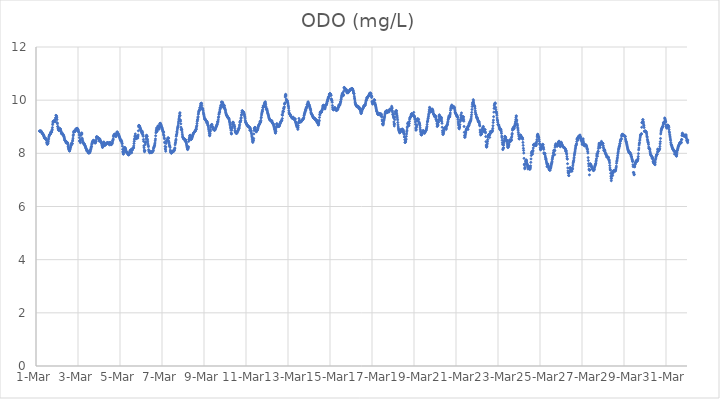
| Category | ODO (mg/L) |
|---|---|
| 44986.166666666664 | 8.84 |
| 44986.177083333336 | 8.83 |
| 44986.1875 | 8.84 |
| 44986.197916666664 | 8.83 |
| 44986.208333333336 | 8.82 |
| 44986.21875 | 8.84 |
| 44986.229166666664 | 8.84 |
| 44986.239583333336 | 8.84 |
| 44986.25 | 8.82 |
| 44986.260416666664 | 8.8 |
| 44986.270833333336 | 8.79 |
| 44986.28125 | 8.77 |
| 44986.291666666664 | 8.76 |
| 44986.302083333336 | 8.74 |
| 44986.3125 | 8.75 |
| 44986.322916666664 | 8.73 |
| 44986.333333333336 | 8.72 |
| 44986.34375 | 8.71 |
| 44986.354166666664 | 8.69 |
| 44986.364583333336 | 8.66 |
| 44986.375 | 8.66 |
| 44986.385416666664 | 8.63 |
| 44986.395833333336 | 8.6 |
| 44986.40625 | 8.57 |
| 44986.416666666664 | 8.58 |
| 44986.427083333336 | 8.57 |
| 44986.4375 | 8.57 |
| 44986.447916666664 | 8.56 |
| 44986.458333333336 | 8.54 |
| 44986.46875 | 8.54 |
| 44986.479166666664 | 8.55 |
| 44986.489583333336 | 8.5 |
| 44986.5 | 8.48 |
| 44986.510416666664 | 8.4 |
| 44986.520833333336 | 8.39 |
| 44986.53125 | 8.35 |
| 44986.541666666664 | 8.34 |
| 44986.552083333336 | 8.35 |
| 44986.5625 | 8.37 |
| 44986.572916666664 | 8.39 |
| 44986.583333333336 | 8.44 |
| 44986.59375 | 8.51 |
| 44986.604166666664 | 8.57 |
| 44986.614583333336 | 8.62 |
| 44986.625 | 8.65 |
| 44986.635416666664 | 8.68 |
| 44986.645833333336 | 8.7 |
| 44986.65625 | 8.7 |
| 44986.666666666664 | 8.72 |
| 44986.677083333336 | 8.72 |
| 44986.6875 | 8.73 |
| 44986.697916666664 | 8.78 |
| 44986.708333333336 | 8.79 |
| 44986.71875 | 8.81 |
| 44986.729166666664 | 8.79 |
| 44986.739583333336 | 8.8 |
| 44986.75 | 8.8 |
| 44986.760416666664 | 8.86 |
| 44986.770833333336 | 8.9 |
| 44986.78125 | 8.97 |
| 44986.791666666664 | 9.08 |
| 44986.802083333336 | 9.14 |
| 44986.8125 | 9.19 |
| 44986.822916666664 | 9.2 |
| 44986.833333333336 | 9.2 |
| 44986.84375 | 9.21 |
| 44986.854166666664 | 9.22 |
| 44986.864583333336 | 9.23 |
| 44986.875 | 9.22 |
| 44986.885416666664 | 9.23 |
| 44986.895833333336 | 9.22 |
| 44986.90625 | 9.2 |
| 44986.916666666664 | 9.19 |
| 44986.927083333336 | 9.33 |
| 44986.9375 | 9.28 |
| 44986.947916666664 | 9.43 |
| 44986.958333333336 | 9.35 |
| 44986.96875 | 9.42 |
| 44986.979166666664 | 9.39 |
| 44986.989583333336 | 9.34 |
| 44987.0 | 9.27 |
| 44987.010416666664 | 9.15 |
| 44987.020833333336 | 9.11 |
| 44987.03125 | 9.01 |
| 44987.041666666664 | 9 |
| 44987.052083333336 | 8.94 |
| 44987.0625 | 8.91 |
| 44987.072916666664 | 8.88 |
| 44987.083333333336 | 8.88 |
| 44987.09375 | 8.86 |
| 44987.104166666664 | 8.87 |
| 44987.114583333336 | 8.89 |
| 44987.125 | 8.92 |
| 44987.135416666664 | 8.93 |
| 44987.145833333336 | 8.92 |
| 44987.15625 | 8.92 |
| 44987.166666666664 | 8.9 |
| 44987.177083333336 | 8.85 |
| 44987.1875 | 8.83 |
| 44987.197916666664 | 8.8 |
| 44987.208333333336 | 8.76 |
| 44987.21875 | 8.73 |
| 44987.229166666664 | 8.75 |
| 44987.239583333336 | 8.75 |
| 44987.25 | 8.76 |
| 44987.260416666664 | 8.73 |
| 44987.270833333336 | 8.72 |
| 44987.28125 | 8.72 |
| 44987.291666666664 | 8.7 |
| 44987.302083333336 | 8.68 |
| 44987.3125 | 8.67 |
| 44987.322916666664 | 8.65 |
| 44987.333333333336 | 8.63 |
| 44987.34375 | 8.59 |
| 44987.354166666664 | 8.55 |
| 44987.364583333336 | 8.51 |
| 44987.375 | 8.49 |
| 44987.385416666664 | 8.48 |
| 44987.395833333336 | 8.47 |
| 44987.40625 | 8.46 |
| 44987.416666666664 | 8.45 |
| 44987.427083333336 | 8.41 |
| 44987.4375 | 8.39 |
| 44987.447916666664 | 8.43 |
| 44987.458333333336 | 8.42 |
| 44987.46875 | 8.42 |
| 44987.479166666664 | 8.39 |
| 44987.489583333336 | 8.41 |
| 44987.5 | 8.39 |
| 44987.510416666664 | 8.37 |
| 44987.520833333336 | 8.33 |
| 44987.53125 | 8.26 |
| 44987.541666666664 | 8.23 |
| 44987.552083333336 | 8.18 |
| 44987.5625 | 8.16 |
| 44987.572916666664 | 8.15 |
| 44987.583333333336 | 8.11 |
| 44987.59375 | 8.09 |
| 44987.604166666664 | 8.09 |
| 44987.614583333336 | 8.13 |
| 44987.625 | 8.16 |
| 44987.635416666664 | 8.2 |
| 44987.645833333336 | 8.23 |
| 44987.65625 | 8.3 |
| 44987.666666666664 | 8.28 |
| 44987.677083333336 | 8.34 |
| 44987.6875 | 8.38 |
| 44987.697916666664 | 8.33 |
| 44987.708333333336 | 8.36 |
| 44987.71875 | 8.36 |
| 44987.729166666664 | 8.37 |
| 44987.739583333336 | 8.46 |
| 44987.75 | 8.5 |
| 44987.760416666664 | 8.57 |
| 44987.770833333336 | 8.66 |
| 44987.78125 | 8.71 |
| 44987.791666666664 | 8.79 |
| 44987.802083333336 | 8.82 |
| 44987.8125 | 8.84 |
| 44987.822916666664 | 8.82 |
| 44987.833333333336 | 8.82 |
| 44987.84375 | 8.82 |
| 44987.854166666664 | 8.82 |
| 44987.864583333336 | 8.84 |
| 44987.875 | 8.85 |
| 44987.885416666664 | 8.88 |
| 44987.895833333336 | 8.91 |
| 44987.90625 | 8.92 |
| 44987.916666666664 | 8.9 |
| 44987.927083333336 | 8.9 |
| 44987.9375 | 8.9 |
| 44987.947916666664 | 8.94 |
| 44987.958333333336 | 8.93 |
| 44987.96875 | 8.94 |
| 44987.979166666664 | 8.91 |
| 44987.989583333336 | 8.9 |
| 44988.0 | 8.9 |
| 44988.010416666664 | 8.83 |
| 44988.020833333336 | 8.84 |
| 44988.03125 | 8.81 |
| 44988.041666666664 | 8.78 |
| 44988.052083333336 | 8.69 |
| 44988.0625 | 8.59 |
| 44988.072916666664 | 8.46 |
| 44988.083333333336 | 8.47 |
| 44988.09375 | 8.47 |
| 44988.104166666664 | 8.48 |
| 44988.114583333336 | 8.4 |
| 44988.125 | 8.52 |
| 44988.135416666664 | 8.67 |
| 44988.145833333336 | 8.72 |
| 44988.15625 | 8.74 |
| 44988.166666666664 | 8.72 |
| 44988.177083333336 | 8.77 |
| 44988.1875 | 8.73 |
| 44988.197916666664 | 8.57 |
| 44988.208333333336 | 8.53 |
| 44988.21875 | 8.47 |
| 44988.229166666664 | 8.44 |
| 44988.239583333336 | 8.41 |
| 44988.25 | 8.39 |
| 44988.260416666664 | 8.38 |
| 44988.270833333336 | 8.38 |
| 44988.28125 | 8.36 |
| 44988.291666666664 | 8.34 |
| 44988.302083333336 | 8.34 |
| 44988.3125 | 8.34 |
| 44988.322916666664 | 8.31 |
| 44988.333333333336 | 8.29 |
| 44988.34375 | 8.27 |
| 44988.354166666664 | 8.25 |
| 44988.364583333336 | 8.21 |
| 44988.375 | 8.2 |
| 44988.385416666664 | 8.18 |
| 44988.395833333336 | 8.16 |
| 44988.40625 | 8.14 |
| 44988.416666666664 | 8.11 |
| 44988.427083333336 | 8.09 |
| 44988.4375 | 8.08 |
| 44988.447916666664 | 8.09 |
| 44988.458333333336 | 8.1 |
| 44988.46875 | 8.09 |
| 44988.479166666664 | 8.06 |
| 44988.489583333336 | 8.02 |
| 44988.5 | 8.01 |
| 44988.510416666664 | 8.03 |
| 44988.520833333336 | 8.04 |
| 44988.53125 | 8.02 |
| 44988.541666666664 | 8.03 |
| 44988.552083333336 | 8.02 |
| 44988.5625 | 8.05 |
| 44988.572916666664 | 8.05 |
| 44988.583333333336 | 8.08 |
| 44988.59375 | 8.13 |
| 44988.604166666664 | 8.14 |
| 44988.614583333336 | 8.18 |
| 44988.625 | 8.22 |
| 44988.635416666664 | 8.26 |
| 44988.645833333336 | 8.26 |
| 44988.65625 | 8.34 |
| 44988.666666666664 | 8.37 |
| 44988.677083333336 | 8.4 |
| 44988.6875 | 8.43 |
| 44988.697916666664 | 8.44 |
| 44988.708333333336 | 8.46 |
| 44988.71875 | 8.47 |
| 44988.729166666664 | 8.48 |
| 44988.739583333336 | 8.49 |
| 44988.75 | 8.48 |
| 44988.760416666664 | 8.46 |
| 44988.770833333336 | 8.43 |
| 44988.78125 | 8.41 |
| 44988.791666666664 | 8.4 |
| 44988.802083333336 | 8.4 |
| 44988.8125 | 8.4 |
| 44988.822916666664 | 8.39 |
| 44988.833333333336 | 8.4 |
| 44988.84375 | 8.44 |
| 44988.854166666664 | 8.45 |
| 44988.864583333336 | 8.5 |
| 44988.875 | 8.58 |
| 44988.885416666664 | 8.63 |
| 44988.895833333336 | 8.62 |
| 44988.90625 | 8.61 |
| 44988.916666666664 | 8.6 |
| 44988.927083333336 | 8.6 |
| 44988.9375 | 8.59 |
| 44988.947916666664 | 8.59 |
| 44988.958333333336 | 8.58 |
| 44988.96875 | 8.57 |
| 44988.979166666664 | 8.57 |
| 44988.989583333336 | 8.54 |
| 44989.0 | 8.52 |
| 44989.010416666664 | 8.46 |
| 44989.020833333336 | 8.51 |
| 44989.03125 | 8.55 |
| 44989.041666666664 | 8.52 |
| 44989.052083333336 | 8.48 |
| 44989.0625 | 8.46 |
| 44989.072916666664 | 8.48 |
| 44989.083333333336 | 8.44 |
| 44989.09375 | 8.42 |
| 44989.104166666664 | 8.42 |
| 44989.114583333336 | 8.41 |
| 44989.125 | 8.36 |
| 44989.135416666664 | 8.36 |
| 44989.145833333336 | 8.3 |
| 44989.15625 | 8.27 |
| 44989.166666666664 | 8.22 |
| 44989.177083333336 | 8.24 |
| 44989.1875 | 8.27 |
| 44989.197916666664 | 8.32 |
| 44989.208333333336 | 8.39 |
| 44989.21875 | 8.31 |
| 44989.229166666664 | 8.43 |
| 44989.239583333336 | 8.4 |
| 44989.25 | 8.31 |
| 44989.260416666664 | 8.3 |
| 44989.270833333336 | 8.29 |
| 44989.28125 | 8.34 |
| 44989.291666666664 | 8.33 |
| 44989.302083333336 | 8.32 |
| 44989.3125 | 8.33 |
| 44989.322916666664 | 8.35 |
| 44989.333333333336 | 8.34 |
| 44989.34375 | 8.35 |
| 44989.354166666664 | 8.37 |
| 44989.364583333336 | 8.38 |
| 44989.375 | 8.39 |
| 44989.385416666664 | 8.39 |
| 44989.395833333336 | 8.4 |
| 44989.40625 | 8.4 |
| 44989.416666666664 | 8.39 |
| 44989.427083333336 | 8.39 |
| 44989.4375 | 8.39 |
| 44989.447916666664 | 8.38 |
| 44989.458333333336 | 8.35 |
| 44989.46875 | 8.39 |
| 44989.479166666664 | 8.38 |
| 44989.489583333336 | 8.38 |
| 44989.5 | 8.32 |
| 44989.510416666664 | 8.4 |
| 44989.520833333336 | 8.39 |
| 44989.53125 | 8.41 |
| 44989.541666666664 | 8.39 |
| 44989.552083333336 | 8.37 |
| 44989.5625 | 8.38 |
| 44989.572916666664 | 8.32 |
| 44989.583333333336 | 8.35 |
| 44989.59375 | 8.34 |
| 44989.604166666664 | 8.34 |
| 44989.614583333336 | 8.36 |
| 44989.625 | 8.38 |
| 44989.635416666664 | 8.4 |
| 44989.645833333336 | 8.46 |
| 44989.65625 | 8.48 |
| 44989.666666666664 | 8.51 |
| 44989.677083333336 | 8.54 |
| 44989.6875 | 8.63 |
| 44989.697916666664 | 8.67 |
| 44989.708333333336 | 8.68 |
| 44989.71875 | 8.69 |
| 44989.729166666664 | 8.71 |
| 44989.739583333336 | 8.71 |
| 44989.75 | 8.72 |
| 44989.760416666664 | 8.72 |
| 44989.770833333336 | 8.64 |
| 44989.78125 | 8.68 |
| 44989.791666666664 | 8.68 |
| 44989.802083333336 | 8.67 |
| 44989.8125 | 8.63 |
| 44989.822916666664 | 8.66 |
| 44989.833333333336 | 8.7 |
| 44989.84375 | 8.76 |
| 44989.854166666664 | 8.79 |
| 44989.864583333336 | 8.81 |
| 44989.875 | 8.79 |
| 44989.885416666664 | 8.78 |
| 44989.895833333336 | 8.75 |
| 44989.90625 | 8.73 |
| 44989.916666666664 | 8.72 |
| 44989.927083333336 | 8.72 |
| 44989.9375 | 8.7 |
| 44989.947916666664 | 8.67 |
| 44989.958333333336 | 8.65 |
| 44989.96875 | 8.62 |
| 44989.979166666664 | 8.6 |
| 44989.989583333336 | 8.58 |
| 44990.0 | 8.55 |
| 44990.010416666664 | 8.52 |
| 44990.020833333336 | 8.5 |
| 44990.03125 | 8.47 |
| 44990.041666666664 | 8.51 |
| 44990.052083333336 | 8.49 |
| 44990.0625 | 8.46 |
| 44990.072916666664 | 8.45 |
| 44990.083333333336 | 8.43 |
| 44990.09375 | 8.39 |
| 44990.104166666664 | 8.36 |
| 44990.114583333336 | 8.27 |
| 44990.125 | 8.15 |
| 44990.135416666664 | 8.06 |
| 44990.145833333336 | 8.04 |
| 44990.15625 | 7.97 |
| 44990.166666666664 | 7.98 |
| 44990.177083333336 | 8.05 |
| 44990.1875 | 8.12 |
| 44990.197916666664 | 8.21 |
| 44990.208333333336 | 8.18 |
| 44990.21875 | 8.22 |
| 44990.229166666664 | 8.21 |
| 44990.239583333336 | 8.21 |
| 44990.25 | 8.19 |
| 44990.260416666664 | 8.12 |
| 44990.270833333336 | 8.16 |
| 44990.28125 | 8.12 |
| 44990.291666666664 | 8.08 |
| 44990.302083333336 | 8.05 |
| 44990.3125 | 8.04 |
| 44990.322916666664 | 8.03 |
| 44990.333333333336 | 8.01 |
| 44990.34375 | 8.01 |
| 44990.354166666664 | 8.01 |
| 44990.364583333336 | 8 |
| 44990.375 | 7.98 |
| 44990.385416666664 | 7.96 |
| 44990.395833333336 | 7.95 |
| 44990.40625 | 7.95 |
| 44990.416666666664 | 7.94 |
| 44990.427083333336 | 7.95 |
| 44990.4375 | 7.96 |
| 44990.447916666664 | 8 |
| 44990.458333333336 | 8.04 |
| 44990.46875 | 8.07 |
| 44990.479166666664 | 8.09 |
| 44990.489583333336 | 8.1 |
| 44990.5 | 8.11 |
| 44990.510416666664 | 8.13 |
| 44990.520833333336 | 8.13 |
| 44990.53125 | 8.13 |
| 44990.541666666664 | 8.05 |
| 44990.552083333336 | 8.02 |
| 44990.5625 | 8.14 |
| 44990.572916666664 | 8.12 |
| 44990.583333333336 | 8.12 |
| 44990.59375 | 8.15 |
| 44990.604166666664 | 8.18 |
| 44990.614583333336 | 8.19 |
| 44990.625 | 8.21 |
| 44990.635416666664 | 8.21 |
| 44990.645833333336 | 8.21 |
| 44990.65625 | 8.28 |
| 44990.666666666664 | 8.37 |
| 44990.677083333336 | 8.45 |
| 44990.6875 | 8.52 |
| 44990.697916666664 | 8.56 |
| 44990.708333333336 | 8.65 |
| 44990.71875 | 8.64 |
| 44990.729166666664 | 8.73 |
| 44990.739583333336 | 8.64 |
| 44990.75 | 8.55 |
| 44990.760416666664 | 8.58 |
| 44990.770833333336 | 8.55 |
| 44990.78125 | 8.57 |
| 44990.791666666664 | 8.58 |
| 44990.802083333336 | 8.62 |
| 44990.8125 | 8.65 |
| 44990.822916666664 | 8.64 |
| 44990.833333333336 | 8.62 |
| 44990.84375 | 8.57 |
| 44990.854166666664 | 8.62 |
| 44990.864583333336 | 8.69 |
| 44990.875 | 8.85 |
| 44990.885416666664 | 9 |
| 44990.895833333336 | 9.05 |
| 44990.90625 | 9.05 |
| 44990.916666666664 | 9.03 |
| 44990.927083333336 | 9.02 |
| 44990.9375 | 9 |
| 44990.947916666664 | 8.98 |
| 44990.958333333336 | 8.96 |
| 44990.96875 | 8.93 |
| 44990.979166666664 | 8.91 |
| 44990.989583333336 | 8.88 |
| 44991.0 | 8.85 |
| 44991.010416666664 | 8.83 |
| 44991.020833333336 | 8.82 |
| 44991.03125 | 8.8 |
| 44991.041666666664 | 8.75 |
| 44991.052083333336 | 8.78 |
| 44991.0625 | 8.83 |
| 44991.072916666664 | 8.78 |
| 44991.083333333336 | 8.71 |
| 44991.09375 | 8.68 |
| 44991.104166666664 | 8.64 |
| 44991.114583333336 | 8.52 |
| 44991.125 | 8.45 |
| 44991.135416666664 | 8.28 |
| 44991.145833333336 | 8.21 |
| 44991.15625 | 8.12 |
| 44991.166666666664 | 8.06 |
| 44991.177083333336 | 8.09 |
| 44991.1875 | 8.1 |
| 44991.197916666664 | 8.33 |
| 44991.208333333336 | 8.4 |
| 44991.21875 | 8.4 |
| 44991.229166666664 | 8.44 |
| 44991.239583333336 | 8.55 |
| 44991.25 | 8.62 |
| 44991.260416666664 | 8.68 |
| 44991.270833333336 | 8.67 |
| 44991.28125 | 8.63 |
| 44991.291666666664 | 8.64 |
| 44991.302083333336 | 8.54 |
| 44991.3125 | 8.5 |
| 44991.322916666664 | 8.43 |
| 44991.333333333336 | 8.35 |
| 44991.34375 | 8.3 |
| 44991.354166666664 | 8.25 |
| 44991.364583333336 | 8.14 |
| 44991.375 | 8.09 |
| 44991.385416666664 | 8.08 |
| 44991.395833333336 | 8.05 |
| 44991.40625 | 8.04 |
| 44991.416666666664 | 8.02 |
| 44991.427083333336 | 8.02 |
| 44991.4375 | 8.03 |
| 44991.447916666664 | 8.05 |
| 44991.458333333336 | 8.06 |
| 44991.46875 | 8.06 |
| 44991.479166666664 | 8.03 |
| 44991.489583333336 | 8.03 |
| 44991.5 | 8.03 |
| 44991.510416666664 | 8.04 |
| 44991.520833333336 | 8.05 |
| 44991.53125 | 8.05 |
| 44991.541666666664 | 8.06 |
| 44991.552083333336 | 8.07 |
| 44991.5625 | 8.09 |
| 44991.572916666664 | 8.09 |
| 44991.583333333336 | 8.1 |
| 44991.59375 | 8.17 |
| 44991.604166666664 | 8.21 |
| 44991.614583333336 | 8.23 |
| 44991.625 | 8.25 |
| 44991.635416666664 | 8.28 |
| 44991.645833333336 | 8.3 |
| 44991.65625 | 8.35 |
| 44991.666666666664 | 8.39 |
| 44991.677083333336 | 8.47 |
| 44991.6875 | 8.54 |
| 44991.697916666664 | 8.66 |
| 44991.708333333336 | 8.77 |
| 44991.71875 | 8.84 |
| 44991.729166666664 | 8.88 |
| 44991.739583333336 | 8.95 |
| 44991.75 | 8.82 |
| 44991.760416666664 | 8.82 |
| 44991.770833333336 | 8.86 |
| 44991.78125 | 8.91 |
| 44991.791666666664 | 8.96 |
| 44991.802083333336 | 9.01 |
| 44991.8125 | 9.03 |
| 44991.822916666664 | 9.03 |
| 44991.833333333336 | 9.01 |
| 44991.84375 | 8.98 |
| 44991.854166666664 | 8.91 |
| 44991.864583333336 | 8.92 |
| 44991.875 | 8.97 |
| 44991.885416666664 | 9.01 |
| 44991.895833333336 | 9.1 |
| 44991.90625 | 9.13 |
| 44991.916666666664 | 9.13 |
| 44991.927083333336 | 9.12 |
| 44991.9375 | 9.1 |
| 44991.947916666664 | 9.08 |
| 44991.958333333336 | 9.05 |
| 44991.96875 | 9.02 |
| 44991.979166666664 | 9 |
| 44991.989583333336 | 8.98 |
| 44992.0 | 8.96 |
| 44992.010416666664 | 8.93 |
| 44992.020833333336 | 8.89 |
| 44992.03125 | 8.86 |
| 44992.041666666664 | 8.83 |
| 44992.052083333336 | 8.81 |
| 44992.0625 | 8.77 |
| 44992.072916666664 | 8.7 |
| 44992.083333333336 | 8.8 |
| 44992.09375 | 8.66 |
| 44992.104166666664 | 8.58 |
| 44992.114583333336 | 8.55 |
| 44992.125 | 8.42 |
| 44992.135416666664 | 8.39 |
| 44992.145833333336 | 8.26 |
| 44992.15625 | 8.17 |
| 44992.166666666664 | 8.14 |
| 44992.177083333336 | 8.08 |
| 44992.1875 | 8.24 |
| 44992.197916666664 | 8.37 |
| 44992.208333333336 | 8.43 |
| 44992.21875 | 8.49 |
| 44992.229166666664 | 8.48 |
| 44992.239583333336 | 8.47 |
| 44992.25 | 8.49 |
| 44992.260416666664 | 8.47 |
| 44992.270833333336 | 8.55 |
| 44992.28125 | 8.58 |
| 44992.291666666664 | 8.58 |
| 44992.302083333336 | 8.58 |
| 44992.3125 | 8.56 |
| 44992.322916666664 | 8.46 |
| 44992.333333333336 | 8.41 |
| 44992.34375 | 8.35 |
| 44992.354166666664 | 8.3 |
| 44992.364583333336 | 8.27 |
| 44992.375 | 8.27 |
| 44992.385416666664 | 8.22 |
| 44992.395833333336 | 8.12 |
| 44992.40625 | 8.06 |
| 44992.416666666664 | 8.05 |
| 44992.427083333336 | 8.03 |
| 44992.4375 | 8.01 |
| 44992.447916666664 | 8.01 |
| 44992.458333333336 | 8.02 |
| 44992.46875 | 8.04 |
| 44992.479166666664 | 8.05 |
| 44992.489583333336 | 8.07 |
| 44992.5 | 8.08 |
| 44992.510416666664 | 8.08 |
| 44992.520833333336 | 8.07 |
| 44992.53125 | 8.07 |
| 44992.541666666664 | 8.08 |
| 44992.552083333336 | 8.07 |
| 44992.5625 | 8.09 |
| 44992.572916666664 | 8.1 |
| 44992.583333333336 | 8.11 |
| 44992.59375 | 8.14 |
| 44992.604166666664 | 8.19 |
| 44992.614583333336 | 8.2 |
| 44992.625 | 8.32 |
| 44992.635416666664 | 8.38 |
| 44992.645833333336 | 8.42 |
| 44992.65625 | 8.48 |
| 44992.666666666664 | 8.53 |
| 44992.677083333336 | 8.64 |
| 44992.6875 | 8.69 |
| 44992.697916666664 | 8.72 |
| 44992.708333333336 | 8.82 |
| 44992.71875 | 8.77 |
| 44992.729166666664 | 8.88 |
| 44992.739583333336 | 8.94 |
| 44992.75 | 8.98 |
| 44992.760416666664 | 9.01 |
| 44992.770833333336 | 9.06 |
| 44992.78125 | 9.14 |
| 44992.791666666664 | 9.2 |
| 44992.802083333336 | 9.26 |
| 44992.8125 | 9.32 |
| 44992.822916666664 | 9.37 |
| 44992.833333333336 | 9.42 |
| 44992.84375 | 9.49 |
| 44992.854166666664 | 9.53 |
| 44992.864583333336 | 9.42 |
| 44992.875 | 9.26 |
| 44992.885416666664 | 9.21 |
| 44992.895833333336 | 9.11 |
| 44992.90625 | 8.98 |
| 44992.916666666664 | 8.89 |
| 44992.927083333336 | 8.9 |
| 44992.9375 | 8.91 |
| 44992.947916666664 | 8.88 |
| 44992.958333333336 | 8.8 |
| 44992.96875 | 8.72 |
| 44992.979166666664 | 8.65 |
| 44992.989583333336 | 8.61 |
| 44993.0 | 8.59 |
| 44993.010416666664 | 8.58 |
| 44993.020833333336 | 8.56 |
| 44993.03125 | 8.55 |
| 44993.041666666664 | 8.54 |
| 44993.052083333336 | 8.53 |
| 44993.0625 | 8.53 |
| 44993.072916666664 | 8.53 |
| 44993.083333333336 | 8.53 |
| 44993.09375 | 8.52 |
| 44993.104166666664 | 8.46 |
| 44993.114583333336 | 8.51 |
| 44993.125 | 8.5 |
| 44993.135416666664 | 8.45 |
| 44993.145833333336 | 8.41 |
| 44993.15625 | 8.39 |
| 44993.166666666664 | 8.35 |
| 44993.177083333336 | 8.3 |
| 44993.1875 | 8.26 |
| 44993.197916666664 | 8.22 |
| 44993.208333333336 | 8.17 |
| 44993.21875 | 8.14 |
| 44993.229166666664 | 8.16 |
| 44993.239583333336 | 8.18 |
| 44993.25 | 8.21 |
| 44993.260416666664 | 8.25 |
| 44993.270833333336 | 8.45 |
| 44993.28125 | 8.52 |
| 44993.291666666664 | 8.52 |
| 44993.302083333336 | 8.57 |
| 44993.3125 | 8.61 |
| 44993.322916666664 | 8.66 |
| 44993.333333333336 | 8.68 |
| 44993.34375 | 8.68 |
| 44993.354166666664 | 8.58 |
| 44993.364583333336 | 8.55 |
| 44993.375 | 8.53 |
| 44993.385416666664 | 8.52 |
| 44993.395833333336 | 8.53 |
| 44993.40625 | 8.55 |
| 44993.416666666664 | 8.57 |
| 44993.427083333336 | 8.58 |
| 44993.4375 | 8.61 |
| 44993.447916666664 | 8.65 |
| 44993.458333333336 | 8.66 |
| 44993.46875 | 8.69 |
| 44993.479166666664 | 8.71 |
| 44993.489583333336 | 8.74 |
| 44993.5 | 8.75 |
| 44993.510416666664 | 8.77 |
| 44993.520833333336 | 8.78 |
| 44993.53125 | 8.79 |
| 44993.541666666664 | 8.8 |
| 44993.552083333336 | 8.81 |
| 44993.5625 | 8.82 |
| 44993.572916666664 | 8.84 |
| 44993.583333333336 | 8.84 |
| 44993.59375 | 8.85 |
| 44993.604166666664 | 8.88 |
| 44993.614583333336 | 8.89 |
| 44993.625 | 8.95 |
| 44993.635416666664 | 8.91 |
| 44993.645833333336 | 9 |
| 44993.65625 | 9.04 |
| 44993.666666666664 | 9.12 |
| 44993.677083333336 | 9.2 |
| 44993.6875 | 9.25 |
| 44993.697916666664 | 9.28 |
| 44993.708333333336 | 9.34 |
| 44993.71875 | 9.38 |
| 44993.729166666664 | 9.47 |
| 44993.739583333336 | 9.52 |
| 44993.75 | 9.57 |
| 44993.760416666664 | 9.59 |
| 44993.770833333336 | 9.62 |
| 44993.78125 | 9.62 |
| 44993.791666666664 | 9.65 |
| 44993.802083333336 | 9.71 |
| 44993.8125 | 9.71 |
| 44993.822916666664 | 9.73 |
| 44993.833333333336 | 9.79 |
| 44993.84375 | 9.85 |
| 44993.854166666664 | 9.88 |
| 44993.864583333336 | 9.87 |
| 44993.875 | 9.89 |
| 44993.885416666664 | 9.87 |
| 44993.895833333336 | 9.8 |
| 44993.90625 | 9.72 |
| 44993.916666666664 | 9.66 |
| 44993.927083333336 | 9.67 |
| 44993.9375 | 9.67 |
| 44993.947916666664 | 9.67 |
| 44993.958333333336 | 9.62 |
| 44993.96875 | 9.55 |
| 44993.979166666664 | 9.5 |
| 44993.989583333336 | 9.46 |
| 44994.0 | 9.41 |
| 44994.010416666664 | 9.37 |
| 44994.020833333336 | 9.33 |
| 44994.03125 | 9.3 |
| 44994.041666666664 | 9.28 |
| 44994.052083333336 | 9.27 |
| 44994.0625 | 9.28 |
| 44994.072916666664 | 9.27 |
| 44994.083333333336 | 9.25 |
| 44994.09375 | 9.23 |
| 44994.104166666664 | 9.22 |
| 44994.114583333336 | 9.21 |
| 44994.125 | 9.15 |
| 44994.135416666664 | 9.2 |
| 44994.145833333336 | 9.19 |
| 44994.15625 | 9.15 |
| 44994.166666666664 | 9.13 |
| 44994.177083333336 | 9.09 |
| 44994.1875 | 9.05 |
| 44994.197916666664 | 9.04 |
| 44994.208333333336 | 8.99 |
| 44994.21875 | 8.92 |
| 44994.229166666664 | 8.88 |
| 44994.239583333336 | 8.83 |
| 44994.25 | 8.76 |
| 44994.260416666664 | 8.68 |
| 44994.270833333336 | 8.66 |
| 44994.28125 | 8.69 |
| 44994.291666666664 | 8.74 |
| 44994.302083333336 | 8.82 |
| 44994.3125 | 8.88 |
| 44994.322916666664 | 8.97 |
| 44994.333333333336 | 9.02 |
| 44994.34375 | 9.05 |
| 44994.354166666664 | 9.07 |
| 44994.364583333336 | 9.08 |
| 44994.375 | 9.09 |
| 44994.385416666664 | 9.03 |
| 44994.395833333336 | 9 |
| 44994.40625 | 9 |
| 44994.416666666664 | 8.98 |
| 44994.427083333336 | 8.96 |
| 44994.4375 | 8.92 |
| 44994.447916666664 | 8.9 |
| 44994.458333333336 | 8.9 |
| 44994.46875 | 8.89 |
| 44994.479166666664 | 8.88 |
| 44994.489583333336 | 8.88 |
| 44994.5 | 8.87 |
| 44994.510416666664 | 8.87 |
| 44994.520833333336 | 8.88 |
| 44994.53125 | 8.91 |
| 44994.541666666664 | 8.92 |
| 44994.552083333336 | 8.94 |
| 44994.5625 | 8.97 |
| 44994.572916666664 | 8.99 |
| 44994.583333333336 | 9.01 |
| 44994.59375 | 9.03 |
| 44994.604166666664 | 9.05 |
| 44994.614583333336 | 9.07 |
| 44994.625 | 9.09 |
| 44994.635416666664 | 9.11 |
| 44994.645833333336 | 9.19 |
| 44994.65625 | 9.17 |
| 44994.666666666664 | 9.21 |
| 44994.677083333336 | 9.26 |
| 44994.6875 | 9.34 |
| 44994.697916666664 | 9.38 |
| 44994.708333333336 | 9.47 |
| 44994.71875 | 9.48 |
| 44994.729166666664 | 9.53 |
| 44994.739583333336 | 9.54 |
| 44994.75 | 9.59 |
| 44994.760416666664 | 9.65 |
| 44994.770833333336 | 9.71 |
| 44994.78125 | 9.69 |
| 44994.791666666664 | 9.74 |
| 44994.802083333336 | 9.8 |
| 44994.8125 | 9.79 |
| 44994.822916666664 | 9.83 |
| 44994.833333333336 | 9.93 |
| 44994.84375 | 9.9 |
| 44994.854166666664 | 9.93 |
| 44994.864583333336 | 9.9 |
| 44994.875 | 9.9 |
| 44994.885416666664 | 9.92 |
| 44994.895833333336 | 9.89 |
| 44994.90625 | 9.85 |
| 44994.916666666664 | 9.78 |
| 44994.927083333336 | 9.74 |
| 44994.9375 | 9.72 |
| 44994.947916666664 | 9.8 |
| 44994.958333333336 | 9.81 |
| 44994.96875 | 9.79 |
| 44994.979166666664 | 9.73 |
| 44994.989583333336 | 9.69 |
| 44995.0 | 9.66 |
| 44995.010416666664 | 9.64 |
| 44995.020833333336 | 9.6 |
| 44995.03125 | 9.55 |
| 44995.041666666664 | 9.52 |
| 44995.052083333336 | 9.49 |
| 44995.0625 | 9.46 |
| 44995.072916666664 | 9.44 |
| 44995.083333333336 | 9.42 |
| 44995.09375 | 9.41 |
| 44995.104166666664 | 9.4 |
| 44995.114583333336 | 9.38 |
| 44995.125 | 9.37 |
| 44995.135416666664 | 9.35 |
| 44995.145833333336 | 9.34 |
| 44995.15625 | 9.32 |
| 44995.166666666664 | 9.34 |
| 44995.177083333336 | 9.32 |
| 44995.1875 | 9.3 |
| 44995.197916666664 | 9.27 |
| 44995.208333333336 | 9.22 |
| 44995.21875 | 9.18 |
| 44995.229166666664 | 9.14 |
| 44995.239583333336 | 9.09 |
| 44995.25 | 9.04 |
| 44995.260416666664 | 8.98 |
| 44995.270833333336 | 8.93 |
| 44995.28125 | 8.87 |
| 44995.291666666664 | 8.77 |
| 44995.302083333336 | 8.73 |
| 44995.3125 | 8.74 |
| 44995.322916666664 | 8.87 |
| 44995.333333333336 | 8.95 |
| 44995.34375 | 8.99 |
| 44995.354166666664 | 9.09 |
| 44995.364583333336 | 9.14 |
| 44995.375 | 9.17 |
| 44995.385416666664 | 9.17 |
| 44995.395833333336 | 9.16 |
| 44995.40625 | 9.09 |
| 44995.416666666664 | 9.07 |
| 44995.427083333336 | 9.07 |
| 44995.4375 | 9.06 |
| 44995.447916666664 | 9.01 |
| 44995.458333333336 | 9 |
| 44995.46875 | 8.93 |
| 44995.479166666664 | 8.85 |
| 44995.489583333336 | 8.81 |
| 44995.5 | 8.8 |
| 44995.510416666664 | 8.79 |
| 44995.520833333336 | 8.77 |
| 44995.53125 | 8.76 |
| 44995.541666666664 | 8.75 |
| 44995.552083333336 | 8.75 |
| 44995.5625 | 8.76 |
| 44995.572916666664 | 8.77 |
| 44995.583333333336 | 8.81 |
| 44995.59375 | 8.82 |
| 44995.604166666664 | 8.82 |
| 44995.614583333336 | 8.85 |
| 44995.625 | 8.87 |
| 44995.635416666664 | 8.89 |
| 44995.645833333336 | 8.91 |
| 44995.65625 | 8.92 |
| 44995.666666666664 | 8.96 |
| 44995.677083333336 | 8.95 |
| 44995.6875 | 9.03 |
| 44995.697916666664 | 9.08 |
| 44995.708333333336 | 9.17 |
| 44995.71875 | 9.2 |
| 44995.729166666664 | 9.17 |
| 44995.739583333336 | 9.23 |
| 44995.75 | 9.23 |
| 44995.760416666664 | 9.31 |
| 44995.770833333336 | 9.35 |
| 44995.78125 | 9.44 |
| 44995.791666666664 | 9.46 |
| 44995.802083333336 | 9.54 |
| 44995.8125 | 9.6 |
| 44995.822916666664 | 9.6 |
| 44995.833333333336 | 9.57 |
| 44995.84375 | 9.59 |
| 44995.854166666664 | 9.56 |
| 44995.864583333336 | 9.54 |
| 44995.875 | 9.54 |
| 44995.885416666664 | 9.55 |
| 44995.895833333336 | 9.54 |
| 44995.90625 | 9.5 |
| 44995.916666666664 | 9.47 |
| 44995.927083333336 | 9.44 |
| 44995.9375 | 9.39 |
| 44995.947916666664 | 9.36 |
| 44995.958333333336 | 9.3 |
| 44995.96875 | 9.23 |
| 44995.979166666664 | 9.18 |
| 44995.989583333336 | 9.16 |
| 44996.0 | 9.15 |
| 44996.010416666664 | 9.13 |
| 44996.020833333336 | 9.1 |
| 44996.03125 | 9.09 |
| 44996.041666666664 | 9.07 |
| 44996.052083333336 | 9.07 |
| 44996.0625 | 9.06 |
| 44996.072916666664 | 9.05 |
| 44996.083333333336 | 9.03 |
| 44996.09375 | 9.02 |
| 44996.104166666664 | 9.02 |
| 44996.114583333336 | 9.01 |
| 44996.125 | 9 |
| 44996.135416666664 | 9 |
| 44996.145833333336 | 8.99 |
| 44996.15625 | 8.99 |
| 44996.166666666664 | 8.98 |
| 44996.177083333336 | 8.87 |
| 44996.1875 | 8.94 |
| 44996.197916666664 | 8.96 |
| 44996.208333333336 | 8.92 |
| 44996.21875 | 8.88 |
| 44996.229166666664 | 8.86 |
| 44996.239583333336 | 8.84 |
| 44996.25 | 8.8 |
| 44996.260416666664 | 8.75 |
| 44996.270833333336 | 8.69 |
| 44996.28125 | 8.63 |
| 44996.291666666664 | 8.58 |
| 44996.302083333336 | 8.52 |
| 44996.3125 | 8.46 |
| 44996.322916666664 | 8.41 |
| 44996.333333333336 | 8.45 |
| 44996.34375 | 8.48 |
| 44996.354166666664 | 8.5 |
| 44996.364583333336 | 8.56 |
| 44996.375 | 8.73 |
| 44996.385416666664 | 8.86 |
| 44996.395833333336 | 8.94 |
| 44996.40625 | 8.92 |
| 44996.416666666664 | 8.97 |
| 44996.427083333336 | 8.98 |
| 44996.4375 | 8.97 |
| 44996.447916666664 | 8.9 |
| 44996.458333333336 | 8.89 |
| 44996.46875 | 8.85 |
| 44996.479166666664 | 8.84 |
| 44996.489583333336 | 8.81 |
| 44996.5 | 8.82 |
| 44996.510416666664 | 8.84 |
| 44996.520833333336 | 8.85 |
| 44996.53125 | 8.87 |
| 44996.541666666664 | 8.88 |
| 44996.552083333336 | 8.89 |
| 44996.5625 | 8.93 |
| 44996.572916666664 | 8.96 |
| 44996.583333333336 | 9 |
| 44996.59375 | 9.03 |
| 44996.604166666664 | 9.05 |
| 44996.614583333336 | 9.07 |
| 44996.625 | 9.08 |
| 44996.635416666664 | 9.1 |
| 44996.645833333336 | 9.11 |
| 44996.65625 | 9.13 |
| 44996.666666666664 | 9.2 |
| 44996.677083333336 | 9.16 |
| 44996.6875 | 9.17 |
| 44996.697916666664 | 9.19 |
| 44996.708333333336 | 9.24 |
| 44996.71875 | 9.33 |
| 44996.729166666664 | 9.36 |
| 44996.739583333336 | 9.44 |
| 44996.75 | 9.49 |
| 44996.760416666664 | 9.54 |
| 44996.770833333336 | 9.59 |
| 44996.78125 | 9.58 |
| 44996.791666666664 | 9.64 |
| 44996.802083333336 | 9.72 |
| 44996.8125 | 9.73 |
| 44996.822916666664 | 9.79 |
| 44996.833333333336 | 9.76 |
| 44996.84375 | 9.77 |
| 44996.854166666664 | 9.75 |
| 44996.864583333336 | 9.78 |
| 44996.875 | 9.86 |
| 44996.885416666664 | 9.88 |
| 44996.895833333336 | 9.9 |
| 44996.90625 | 9.92 |
| 44996.916666666664 | 9.94 |
| 44996.927083333336 | 9.88 |
| 44996.9375 | 9.83 |
| 44996.947916666664 | 9.76 |
| 44996.958333333336 | 9.71 |
| 44996.96875 | 9.65 |
| 44996.979166666664 | 9.67 |
| 44996.989583333336 | 9.67 |
| 44997.0 | 9.66 |
| 44997.010416666664 | 9.61 |
| 44997.020833333336 | 9.56 |
| 44997.03125 | 9.52 |
| 44997.041666666664 | 9.5 |
| 44997.052083333336 | 9.47 |
| 44997.0625 | 9.44 |
| 44997.072916666664 | 9.41 |
| 44997.083333333336 | 9.37 |
| 44997.09375 | 9.34 |
| 44997.104166666664 | 9.31 |
| 44997.114583333336 | 9.3 |
| 44997.125 | 9.27 |
| 44997.135416666664 | 9.26 |
| 44997.145833333336 | 9.25 |
| 44997.15625 | 9.25 |
| 44997.166666666664 | 9.24 |
| 44997.177083333336 | 9.24 |
| 44997.1875 | 9.23 |
| 44997.197916666664 | 9.22 |
| 44997.208333333336 | 9.2 |
| 44997.21875 | 9.2 |
| 44997.229166666664 | 9.23 |
| 44997.239583333336 | 9.19 |
| 44997.25 | 9.16 |
| 44997.260416666664 | 9.14 |
| 44997.270833333336 | 9.13 |
| 44997.28125 | 9.13 |
| 44997.291666666664 | 9.1 |
| 44997.302083333336 | 9.1 |
| 44997.3125 | 9.08 |
| 44997.322916666664 | 9.04 |
| 44997.333333333336 | 9.01 |
| 44997.34375 | 8.98 |
| 44997.354166666664 | 8.93 |
| 44997.364583333336 | 8.9 |
| 44997.375 | 8.87 |
| 44997.385416666664 | 8.81 |
| 44997.395833333336 | 8.77 |
| 44997.40625 | 8.76 |
| 44997.416666666664 | 8.88 |
| 44997.427083333336 | 8.83 |
| 44997.4375 | 8.96 |
| 44997.447916666664 | 9.01 |
| 44997.458333333336 | 9.1 |
| 44997.46875 | 9.11 |
| 44997.479166666664 | 9.11 |
| 44997.489583333336 | 9.03 |
| 44997.5 | 9.04 |
| 44997.510416666664 | 9.04 |
| 44997.520833333336 | 9.02 |
| 44997.53125 | 9.02 |
| 44997.541666666664 | 9.02 |
| 44997.552083333336 | 9.01 |
| 44997.5625 | 9.01 |
| 44997.572916666664 | 9.02 |
| 44997.583333333336 | 9.03 |
| 44997.59375 | 9.06 |
| 44997.604166666664 | 9.08 |
| 44997.614583333336 | 9.11 |
| 44997.625 | 9.13 |
| 44997.635416666664 | 9.15 |
| 44997.645833333336 | 9.16 |
| 44997.65625 | 9.18 |
| 44997.666666666664 | 9.2 |
| 44997.677083333336 | 9.21 |
| 44997.6875 | 9.23 |
| 44997.697916666664 | 9.24 |
| 44997.708333333336 | 9.25 |
| 44997.71875 | 9.45 |
| 44997.729166666664 | 9.31 |
| 44997.739583333336 | 9.43 |
| 44997.75 | 9.52 |
| 44997.760416666664 | 9.59 |
| 44997.770833333336 | 9.58 |
| 44997.78125 | 9.57 |
| 44997.791666666664 | 9.69 |
| 44997.802083333336 | 9.67 |
| 44997.8125 | 9.72 |
| 44997.822916666664 | 9.75 |
| 44997.833333333336 | 9.86 |
| 44997.84375 | 9.86 |
| 44997.854166666664 | 9.9 |
| 44997.864583333336 | 10.12 |
| 44997.875 | 10.17 |
| 44997.885416666664 | 10.22 |
| 44997.895833333336 | 10.2 |
| 44997.90625 | 10.16 |
| 44997.916666666664 | 10.04 |
| 44997.927083333336 | 9.99 |
| 44997.9375 | 9.97 |
| 44997.947916666664 | 9.98 |
| 44997.958333333336 | 9.99 |
| 44997.96875 | 9.97 |
| 44997.979166666664 | 9.93 |
| 44997.989583333336 | 9.9 |
| 44998.0 | 9.86 |
| 44998.010416666664 | 9.81 |
| 44998.020833333336 | 9.76 |
| 44998.03125 | 9.7 |
| 44998.041666666664 | 9.61 |
| 44998.052083333336 | 9.54 |
| 44998.0625 | 9.49 |
| 44998.072916666664 | 9.49 |
| 44998.083333333336 | 9.48 |
| 44998.09375 | 9.47 |
| 44998.104166666664 | 9.45 |
| 44998.114583333336 | 9.44 |
| 44998.125 | 9.41 |
| 44998.135416666664 | 9.4 |
| 44998.145833333336 | 9.39 |
| 44998.15625 | 9.38 |
| 44998.166666666664 | 9.37 |
| 44998.177083333336 | 9.35 |
| 44998.1875 | 9.34 |
| 44998.197916666664 | 9.32 |
| 44998.208333333336 | 9.32 |
| 44998.21875 | 9.32 |
| 44998.229166666664 | 9.32 |
| 44998.239583333336 | 9.32 |
| 44998.25 | 9.36 |
| 44998.260416666664 | 9.32 |
| 44998.270833333336 | 9.32 |
| 44998.28125 | 9.29 |
| 44998.291666666664 | 9.27 |
| 44998.302083333336 | 9.3 |
| 44998.3125 | 9.29 |
| 44998.322916666664 | 9.29 |
| 44998.333333333336 | 9.27 |
| 44998.34375 | 9.3 |
| 44998.354166666664 | 9.19 |
| 44998.364583333336 | 9.19 |
| 44998.375 | 9.15 |
| 44998.385416666664 | 9.12 |
| 44998.395833333336 | 9.09 |
| 44998.40625 | 9.04 |
| 44998.416666666664 | 9.05 |
| 44998.427083333336 | 9 |
| 44998.4375 | 8.98 |
| 44998.447916666664 | 9 |
| 44998.458333333336 | 8.97 |
| 44998.46875 | 8.9 |
| 44998.479166666664 | 8.96 |
| 44998.489583333336 | 9.04 |
| 44998.5 | 9.14 |
| 44998.510416666664 | 9.18 |
| 44998.520833333336 | 9.31 |
| 44998.53125 | 9.16 |
| 44998.541666666664 | 9.21 |
| 44998.552083333336 | 9.23 |
| 44998.5625 | 9.22 |
| 44998.572916666664 | 9.22 |
| 44998.583333333336 | 9.2 |
| 44998.59375 | 9.19 |
| 44998.604166666664 | 9.18 |
| 44998.614583333336 | 9.18 |
| 44998.625 | 9.2 |
| 44998.635416666664 | 9.2 |
| 44998.645833333336 | 9.21 |
| 44998.65625 | 9.23 |
| 44998.666666666664 | 9.24 |
| 44998.677083333336 | 9.25 |
| 44998.6875 | 9.27 |
| 44998.697916666664 | 9.27 |
| 44998.708333333336 | 9.28 |
| 44998.71875 | 9.29 |
| 44998.729166666664 | 9.3 |
| 44998.739583333336 | 9.32 |
| 44998.75 | 9.34 |
| 44998.760416666664 | 9.41 |
| 44998.770833333336 | 9.44 |
| 44998.78125 | 9.48 |
| 44998.791666666664 | 9.5 |
| 44998.802083333336 | 9.54 |
| 44998.8125 | 9.56 |
| 44998.822916666664 | 9.59 |
| 44998.833333333336 | 9.64 |
| 44998.84375 | 9.62 |
| 44998.854166666664 | 9.7 |
| 44998.864583333336 | 9.67 |
| 44998.875 | 9.71 |
| 44998.885416666664 | 9.73 |
| 44998.895833333336 | 9.75 |
| 44998.90625 | 9.83 |
| 44998.916666666664 | 9.76 |
| 44998.927083333336 | 9.84 |
| 44998.9375 | 9.86 |
| 44998.947916666664 | 9.91 |
| 44998.958333333336 | 9.94 |
| 44998.96875 | 9.9 |
| 44998.979166666664 | 9.86 |
| 44998.989583333336 | 9.84 |
| 44999.0 | 9.82 |
| 44999.010416666664 | 9.82 |
| 44999.020833333336 | 9.78 |
| 44999.03125 | 9.76 |
| 44999.041666666664 | 9.72 |
| 44999.052083333336 | 9.68 |
| 44999.0625 | 9.67 |
| 44999.072916666664 | 9.65 |
| 44999.083333333336 | 9.6 |
| 44999.09375 | 9.54 |
| 44999.104166666664 | 9.51 |
| 44999.114583333336 | 9.49 |
| 44999.125 | 9.48 |
| 44999.135416666664 | 9.47 |
| 44999.145833333336 | 9.45 |
| 44999.15625 | 9.43 |
| 44999.166666666664 | 9.41 |
| 44999.177083333336 | 9.39 |
| 44999.1875 | 9.37 |
| 44999.197916666664 | 9.36 |
| 44999.208333333336 | 9.35 |
| 44999.21875 | 9.33 |
| 44999.229166666664 | 9.33 |
| 44999.239583333336 | 9.32 |
| 44999.25 | 9.32 |
| 44999.260416666664 | 9.31 |
| 44999.270833333336 | 9.29 |
| 44999.28125 | 9.31 |
| 44999.291666666664 | 9.3 |
| 44999.302083333336 | 9.28 |
| 44999.3125 | 9.25 |
| 44999.322916666664 | 9.24 |
| 44999.333333333336 | 9.25 |
| 44999.34375 | 9.25 |
| 44999.354166666664 | 9.24 |
| 44999.364583333336 | 9.25 |
| 44999.375 | 9.17 |
| 44999.385416666664 | 9.2 |
| 44999.395833333336 | 9.2 |
| 44999.40625 | 9.22 |
| 44999.416666666664 | 9.13 |
| 44999.427083333336 | 9.14 |
| 44999.4375 | 9.07 |
| 44999.447916666664 | 9.13 |
| 44999.458333333336 | 9.07 |
| 44999.46875 | 9.14 |
| 44999.479166666664 | 9.21 |
| 44999.489583333336 | 9.24 |
| 44999.5 | 9.35 |
| 44999.510416666664 | 9.47 |
| 44999.520833333336 | 9.44 |
| 44999.53125 | 9.54 |
| 44999.541666666664 | 9.56 |
| 44999.552083333336 | 9.56 |
| 44999.5625 | 9.53 |
| 44999.572916666664 | 9.54 |
| 44999.583333333336 | 9.55 |
| 44999.59375 | 9.55 |
| 44999.604166666664 | 9.56 |
| 44999.614583333336 | 9.61 |
| 44999.625 | 9.63 |
| 44999.635416666664 | 9.65 |
| 44999.645833333336 | 9.7 |
| 44999.65625 | 9.75 |
| 44999.666666666664 | 9.79 |
| 44999.677083333336 | 9.8 |
| 44999.6875 | 9.81 |
| 44999.697916666664 | 9.8 |
| 44999.708333333336 | 9.79 |
| 44999.71875 | 9.78 |
| 44999.729166666664 | 9.75 |
| 44999.739583333336 | 9.71 |
| 44999.75 | 9.69 |
| 44999.760416666664 | 9.67 |
| 44999.770833333336 | 9.73 |
| 44999.78125 | 9.79 |
| 44999.791666666664 | 9.81 |
| 44999.802083333336 | 9.82 |
| 44999.8125 | 9.82 |
| 44999.822916666664 | 9.82 |
| 44999.833333333336 | 9.84 |
| 44999.84375 | 9.88 |
| 44999.854166666664 | 9.9 |
| 44999.864583333336 | 9.95 |
| 44999.875 | 9.96 |
| 44999.885416666664 | 10 |
| 44999.895833333336 | 10.03 |
| 44999.90625 | 10.05 |
| 44999.916666666664 | 10.09 |
| 44999.927083333336 | 10.08 |
| 44999.9375 | 10.14 |
| 44999.947916666664 | 10.13 |
| 44999.958333333336 | 10.13 |
| 44999.96875 | 10.22 |
| 44999.979166666664 | 10.23 |
| 44999.989583333336 | 10.24 |
| 45000.0 | 10.25 |
| 45000.010416666664 | 10.2 |
| 45000.020833333336 | 10.23 |
| 45000.03125 | 10.22 |
| 45000.041666666664 | 10.19 |
| 45000.052083333336 | 10.18 |
| 45000.0625 | 10.05 |
| 45000.072916666664 | 10.02 |
| 45000.083333333336 | 9.99 |
| 45000.09375 | 9.97 |
| 45000.104166666664 | 9.92 |
| 45000.114583333336 | 9.8 |
| 45000.125 | 9.73 |
| 45000.135416666664 | 9.67 |
| 45000.145833333336 | 9.66 |
| 45000.15625 | 9.65 |
| 45000.166666666664 | 9.64 |
| 45000.177083333336 | 9.64 |
| 45000.1875 | 9.67 |
| 45000.197916666664 | 9.68 |
| 45000.208333333336 | 9.7 |
| 45000.21875 | 9.71 |
| 45000.229166666664 | 9.72 |
| 45000.239583333336 | 9.71 |
| 45000.25 | 9.7 |
| 45000.260416666664 | 9.68 |
| 45000.270833333336 | 9.66 |
| 45000.28125 | 9.65 |
| 45000.291666666664 | 9.64 |
| 45000.302083333336 | 9.61 |
| 45000.3125 | 9.61 |
| 45000.322916666664 | 9.62 |
| 45000.333333333336 | 9.64 |
| 45000.34375 | 9.65 |
| 45000.354166666664 | 9.65 |
| 45000.364583333336 | 9.65 |
| 45000.375 | 9.67 |
| 45000.385416666664 | 9.71 |
| 45000.395833333336 | 9.74 |
| 45000.40625 | 9.73 |
| 45000.416666666664 | 9.8 |
| 45000.427083333336 | 9.82 |
| 45000.4375 | 9.82 |
| 45000.447916666664 | 9.82 |
| 45000.458333333336 | 9.8 |
| 45000.46875 | 9.83 |
| 45000.479166666664 | 9.86 |
| 45000.489583333336 | 9.89 |
| 45000.5 | 9.94 |
| 45000.510416666664 | 9.94 |
| 45000.520833333336 | 10.01 |
| 45000.53125 | 10.04 |
| 45000.541666666664 | 10.09 |
| 45000.552083333336 | 10.14 |
| 45000.5625 | 10.18 |
| 45000.572916666664 | 10.2 |
| 45000.583333333336 | 10.24 |
| 45000.59375 | 10.23 |
| 45000.604166666664 | 10.26 |
| 45000.614583333336 | 10.28 |
| 45000.625 | 10.22 |
| 45000.635416666664 | 10.17 |
| 45000.645833333336 | 10.2 |
| 45000.65625 | 10.34 |
| 45000.666666666664 | 10.46 |
| 45000.677083333336 | 10.48 |
| 45000.6875 | 10.47 |
| 45000.697916666664 | 10.45 |
| 45000.708333333336 | 10.42 |
| 45000.71875 | 10.41 |
| 45000.729166666664 | 10.4 |
| 45000.739583333336 | 10.39 |
| 45000.75 | 10.39 |
| 45000.760416666664 | 10.4 |
| 45000.770833333336 | 10.41 |
| 45000.78125 | 10.38 |
| 45000.791666666664 | 10.33 |
| 45000.802083333336 | 10.3 |
| 45000.8125 | 10.27 |
| 45000.822916666664 | 10.29 |
| 45000.833333333336 | 10.34 |
| 45000.84375 | 10.33 |
| 45000.854166666664 | 10.31 |
| 45000.864583333336 | 10.28 |
| 45000.875 | 10.3 |
| 45000.885416666664 | 10.31 |
| 45000.895833333336 | 10.33 |
| 45000.90625 | 10.34 |
| 45000.916666666664 | 10.36 |
| 45000.927083333336 | 10.35 |
| 45000.9375 | 10.36 |
| 45000.947916666664 | 10.38 |
| 45000.958333333336 | 10.39 |
| 45000.96875 | 10.41 |
| 45000.979166666664 | 10.41 |
| 45000.989583333336 | 10.4 |
| 45001.0 | 10.41 |
| 45001.010416666664 | 10.41 |
| 45001.020833333336 | 10.42 |
| 45001.03125 | 10.42 |
| 45001.041666666664 | 10.44 |
| 45001.052083333336 | 10.43 |
| 45001.0625 | 10.43 |
| 45001.072916666664 | 10.43 |
| 45001.083333333336 | 10.41 |
| 45001.09375 | 10.37 |
| 45001.104166666664 | 10.35 |
| 45001.114583333336 | 10.31 |
| 45001.125 | 10.27 |
| 45001.135416666664 | 10.25 |
| 45001.145833333336 | 10.24 |
| 45001.15625 | 10.15 |
| 45001.166666666664 | 10.08 |
| 45001.177083333336 | 10.04 |
| 45001.1875 | 9.97 |
| 45001.197916666664 | 9.92 |
| 45001.208333333336 | 9.88 |
| 45001.21875 | 9.85 |
| 45001.229166666664 | 9.83 |
| 45001.239583333336 | 9.81 |
| 45001.25 | 9.8 |
| 45001.260416666664 | 9.78 |
| 45001.270833333336 | 9.76 |
| 45001.28125 | 9.76 |
| 45001.291666666664 | 9.77 |
| 45001.302083333336 | 9.77 |
| 45001.3125 | 9.77 |
| 45001.322916666664 | 9.76 |
| 45001.333333333336 | 9.77 |
| 45001.34375 | 9.76 |
| 45001.354166666664 | 9.74 |
| 45001.364583333336 | 9.7 |
| 45001.375 | 9.7 |
| 45001.385416666664 | 9.71 |
| 45001.395833333336 | 9.73 |
| 45001.40625 | 9.7 |
| 45001.416666666664 | 9.67 |
| 45001.427083333336 | 9.65 |
| 45001.4375 | 9.64 |
| 45001.447916666664 | 9.61 |
| 45001.458333333336 | 9.57 |
| 45001.46875 | 9.54 |
| 45001.479166666664 | 9.5 |
| 45001.489583333336 | 9.5 |
| 45001.5 | 9.56 |
| 45001.510416666664 | 9.57 |
| 45001.520833333336 | 9.62 |
| 45001.53125 | 9.65 |
| 45001.541666666664 | 9.65 |
| 45001.552083333336 | 9.67 |
| 45001.5625 | 9.68 |
| 45001.572916666664 | 9.7 |
| 45001.583333333336 | 9.72 |
| 45001.59375 | 9.73 |
| 45001.604166666664 | 9.76 |
| 45001.614583333336 | 9.79 |
| 45001.625 | 9.79 |
| 45001.635416666664 | 9.78 |
| 45001.645833333336 | 9.8 |
| 45001.65625 | 9.81 |
| 45001.666666666664 | 9.81 |
| 45001.677083333336 | 9.82 |
| 45001.6875 | 9.86 |
| 45001.697916666664 | 9.9 |
| 45001.708333333336 | 9.96 |
| 45001.71875 | 10 |
| 45001.729166666664 | 10 |
| 45001.739583333336 | 10.02 |
| 45001.75 | 10.07 |
| 45001.760416666664 | 10.1 |
| 45001.770833333336 | 10.09 |
| 45001.78125 | 10.09 |
| 45001.791666666664 | 10.11 |
| 45001.802083333336 | 10.12 |
| 45001.8125 | 10.14 |
| 45001.822916666664 | 10.15 |
| 45001.833333333336 | 10.17 |
| 45001.84375 | 10.18 |
| 45001.854166666664 | 10.18 |
| 45001.864583333336 | 10.18 |
| 45001.875 | 10.22 |
| 45001.885416666664 | 10.26 |
| 45001.895833333336 | 10.23 |
| 45001.90625 | 10.24 |
| 45001.916666666664 | 10.26 |
| 45001.927083333336 | 10.27 |
| 45001.9375 | 10.25 |
| 45001.947916666664 | 10.24 |
| 45001.958333333336 | 10.19 |
| 45001.96875 | 10.17 |
| 45001.979166666664 | 10.1 |
| 45001.989583333336 | 10.14 |
| 45002.0 | 9.95 |
| 45002.010416666664 | 9.92 |
| 45002.020833333336 | 9.88 |
| 45002.03125 | 9.85 |
| 45002.041666666664 | 9.93 |
| 45002.052083333336 | 9.93 |
| 45002.0625 | 9.96 |
| 45002.072916666664 | 9.96 |
| 45002.083333333336 | 9.97 |
| 45002.09375 | 9.99 |
| 45002.104166666664 | 10.02 |
| 45002.114583333336 | 10.01 |
| 45002.125 | 9.99 |
| 45002.135416666664 | 9.9 |
| 45002.145833333336 | 9.87 |
| 45002.15625 | 9.83 |
| 45002.166666666664 | 9.81 |
| 45002.177083333336 | 9.77 |
| 45002.1875 | 9.73 |
| 45002.197916666664 | 9.69 |
| 45002.208333333336 | 9.64 |
| 45002.21875 | 9.6 |
| 45002.229166666664 | 9.58 |
| 45002.239583333336 | 9.56 |
| 45002.25 | 9.52 |
| 45002.260416666664 | 9.5 |
| 45002.270833333336 | 9.49 |
| 45002.28125 | 9.47 |
| 45002.291666666664 | 9.46 |
| 45002.302083333336 | 9.46 |
| 45002.3125 | 9.47 |
| 45002.322916666664 | 9.48 |
| 45002.333333333336 | 9.49 |
| 45002.34375 | 9.49 |
| 45002.354166666664 | 9.49 |
| 45002.364583333336 | 9.49 |
| 45002.375 | 9.49 |
| 45002.385416666664 | 9.49 |
| 45002.395833333336 | 9.47 |
| 45002.40625 | 9.44 |
| 45002.416666666664 | 9.41 |
| 45002.427083333336 | 9.49 |
| 45002.4375 | 9.44 |
| 45002.447916666664 | 9.46 |
| 45002.458333333336 | 9.39 |
| 45002.46875 | 9.37 |
| 45002.479166666664 | 9.26 |
| 45002.489583333336 | 9.21 |
| 45002.5 | 9.11 |
| 45002.510416666664 | 9.11 |
| 45002.520833333336 | 9.07 |
| 45002.53125 | 9.07 |
| 45002.541666666664 | 9.12 |
| 45002.552083333336 | 9.18 |
| 45002.5625 | 9.24 |
| 45002.572916666664 | 9.27 |
| 45002.583333333336 | 9.32 |
| 45002.59375 | 9.36 |
| 45002.604166666664 | 9.4 |
| 45002.614583333336 | 9.45 |
| 45002.625 | 9.5 |
| 45002.635416666664 | 9.54 |
| 45002.645833333336 | 9.57 |
| 45002.65625 | 9.57 |
| 45002.666666666664 | 9.58 |
| 45002.677083333336 | 9.59 |
| 45002.6875 | 9.6 |
| 45002.697916666664 | 9.6 |
| 45002.708333333336 | 9.53 |
| 45002.71875 | 9.54 |
| 45002.729166666664 | 9.54 |
| 45002.739583333336 | 9.57 |
| 45002.75 | 9.59 |
| 45002.760416666664 | 9.59 |
| 45002.770833333336 | 9.6 |
| 45002.78125 | 9.6 |
| 45002.791666666664 | 9.57 |
| 45002.802083333336 | 9.55 |
| 45002.8125 | 9.58 |
| 45002.822916666664 | 9.6 |
| 45002.833333333336 | 9.63 |
| 45002.84375 | 9.65 |
| 45002.854166666664 | 9.66 |
| 45002.864583333336 | 9.67 |
| 45002.875 | 9.66 |
| 45002.885416666664 | 9.65 |
| 45002.895833333336 | 9.65 |
| 45002.90625 | 9.64 |
| 45002.916666666664 | 9.63 |
| 45002.927083333336 | 9.66 |
| 45002.9375 | 9.77 |
| 45002.947916666664 | 9.72 |
| 45002.958333333336 | 9.69 |
| 45002.96875 | 9.6 |
| 45002.979166666664 | 9.55 |
| 45002.989583333336 | 9.47 |
| 45003.0 | 9.47 |
| 45003.010416666664 | 9.41 |
| 45003.020833333336 | 9.37 |
| 45003.03125 | 9.33 |
| 45003.041666666664 | 9.18 |
| 45003.052083333336 | 9.1 |
| 45003.0625 | 9.03 |
| 45003.072916666664 | 9.11 |
| 45003.083333333336 | 9.27 |
| 45003.09375 | 9.36 |
| 45003.104166666664 | 9.48 |
| 45003.114583333336 | 9.54 |
| 45003.125 | 9.58 |
| 45003.135416666664 | 9.57 |
| 45003.145833333336 | 9.59 |
| 45003.15625 | 9.61 |
| 45003.166666666664 | 9.6 |
| 45003.177083333336 | 9.51 |
| 45003.1875 | 9.44 |
| 45003.197916666664 | 9.4 |
| 45003.208333333336 | 9.33 |
| 45003.21875 | 9.26 |
| 45003.229166666664 | 9.16 |
| 45003.239583333336 | 9.07 |
| 45003.25 | 8.99 |
| 45003.260416666664 | 8.93 |
| 45003.270833333336 | 8.89 |
| 45003.28125 | 8.86 |
| 45003.291666666664 | 8.84 |
| 45003.302083333336 | 8.82 |
| 45003.3125 | 8.78 |
| 45003.322916666664 | 8.77 |
| 45003.333333333336 | 8.79 |
| 45003.34375 | 8.8 |
| 45003.354166666664 | 8.84 |
| 45003.364583333336 | 8.87 |
| 45003.375 | 8.88 |
| 45003.385416666664 | 8.88 |
| 45003.395833333336 | 8.89 |
| 45003.40625 | 8.9 |
| 45003.416666666664 | 8.89 |
| 45003.427083333336 | 8.9 |
| 45003.4375 | 8.91 |
| 45003.447916666664 | 8.91 |
| 45003.458333333336 | 8.82 |
| 45003.46875 | 8.8 |
| 45003.479166666664 | 8.86 |
| 45003.489583333336 | 8.88 |
| 45003.5 | 8.83 |
| 45003.510416666664 | 8.78 |
| 45003.520833333336 | 8.75 |
| 45003.53125 | 8.71 |
| 45003.541666666664 | 8.62 |
| 45003.552083333336 | 8.61 |
| 45003.5625 | 8.51 |
| 45003.572916666664 | 8.41 |
| 45003.583333333336 | 8.41 |
| 45003.59375 | 8.43 |
| 45003.604166666664 | 8.46 |
| 45003.614583333336 | 8.51 |
| 45003.625 | 8.54 |
| 45003.635416666664 | 8.64 |
| 45003.645833333336 | 8.73 |
| 45003.65625 | 8.81 |
| 45003.666666666664 | 8.87 |
| 45003.677083333336 | 8.96 |
| 45003.6875 | 9.01 |
| 45003.697916666664 | 9.11 |
| 45003.708333333336 | 9.14 |
| 45003.71875 | 9.12 |
| 45003.729166666664 | 9.16 |
| 45003.739583333336 | 9.12 |
| 45003.75 | 9.12 |
| 45003.760416666664 | 9.04 |
| 45003.770833333336 | 9.12 |
| 45003.78125 | 9.2 |
| 45003.791666666664 | 9.28 |
| 45003.802083333336 | 9.32 |
| 45003.8125 | 9.35 |
| 45003.822916666664 | 9.35 |
| 45003.833333333336 | 9.36 |
| 45003.84375 | 9.38 |
| 45003.854166666664 | 9.41 |
| 45003.864583333336 | 9.45 |
| 45003.875 | 9.48 |
| 45003.885416666664 | 9.48 |
| 45003.895833333336 | 9.49 |
| 45003.90625 | 9.48 |
| 45003.916666666664 | 9.47 |
| 45003.927083333336 | 9.46 |
| 45003.9375 | 9.45 |
| 45003.947916666664 | 9.43 |
| 45003.958333333336 | 9.42 |
| 45003.96875 | 9.41 |
| 45003.979166666664 | 9.42 |
| 45003.989583333336 | 9.54 |
| 45004.0 | 9.42 |
| 45004.010416666664 | 9.4 |
| 45004.020833333336 | 9.38 |
| 45004.03125 | 9.35 |
| 45004.041666666664 | 9.3 |
| 45004.052083333336 | 9.27 |
| 45004.0625 | 9.18 |
| 45004.072916666664 | 9.09 |
| 45004.083333333336 | 8.95 |
| 45004.09375 | 8.87 |
| 45004.104166666664 | 8.89 |
| 45004.114583333336 | 8.97 |
| 45004.125 | 9.02 |
| 45004.135416666664 | 9.07 |
| 45004.145833333336 | 9.21 |
| 45004.15625 | 9.25 |
| 45004.166666666664 | 9.29 |
| 45004.177083333336 | 9.3 |
| 45004.1875 | 9.29 |
| 45004.197916666664 | 9.28 |
| 45004.208333333336 | 9.28 |
| 45004.21875 | 9.27 |
| 45004.229166666664 | 9.19 |
| 45004.239583333336 | 9.13 |
| 45004.25 | 9.14 |
| 45004.260416666664 | 9.13 |
| 45004.270833333336 | 9.1 |
| 45004.28125 | 9.04 |
| 45004.291666666664 | 8.96 |
| 45004.302083333336 | 8.89 |
| 45004.3125 | 8.83 |
| 45004.322916666664 | 8.77 |
| 45004.333333333336 | 8.71 |
| 45004.34375 | 8.7 |
| 45004.354166666664 | 8.69 |
| 45004.364583333336 | 8.7 |
| 45004.375 | 8.72 |
| 45004.385416666664 | 8.75 |
| 45004.395833333336 | 8.79 |
| 45004.40625 | 8.81 |
| 45004.416666666664 | 8.83 |
| 45004.427083333336 | 8.85 |
| 45004.4375 | 8.85 |
| 45004.447916666664 | 8.84 |
| 45004.458333333336 | 8.83 |
| 45004.46875 | 8.83 |
| 45004.479166666664 | 8.82 |
| 45004.489583333336 | 8.78 |
| 45004.5 | 8.75 |
| 45004.510416666664 | 8.78 |
| 45004.520833333336 | 8.82 |
| 45004.53125 | 8.82 |
| 45004.541666666664 | 8.81 |
| 45004.552083333336 | 8.83 |
| 45004.5625 | 8.85 |
| 45004.572916666664 | 8.87 |
| 45004.583333333336 | 8.88 |
| 45004.59375 | 8.92 |
| 45004.604166666664 | 8.96 |
| 45004.614583333336 | 9.01 |
| 45004.625 | 9.09 |
| 45004.635416666664 | 9.18 |
| 45004.645833333336 | 9.2 |
| 45004.65625 | 9.25 |
| 45004.666666666664 | 9.3 |
| 45004.677083333336 | 9.33 |
| 45004.6875 | 9.39 |
| 45004.697916666664 | 9.45 |
| 45004.708333333336 | 9.5 |
| 45004.71875 | 9.56 |
| 45004.729166666664 | 9.64 |
| 45004.739583333336 | 9.73 |
| 45004.75 | 9.61 |
| 45004.760416666664 | 9.71 |
| 45004.770833333336 | 9.68 |
| 45004.78125 | 9.64 |
| 45004.791666666664 | 9.56 |
| 45004.802083333336 | 9.56 |
| 45004.8125 | 9.57 |
| 45004.822916666664 | 9.59 |
| 45004.833333333336 | 9.59 |
| 45004.84375 | 9.64 |
| 45004.854166666664 | 9.65 |
| 45004.864583333336 | 9.66 |
| 45004.875 | 9.66 |
| 45004.885416666664 | 9.64 |
| 45004.895833333336 | 9.62 |
| 45004.90625 | 9.58 |
| 45004.916666666664 | 9.52 |
| 45004.927083333336 | 9.49 |
| 45004.9375 | 9.47 |
| 45004.947916666664 | 9.46 |
| 45004.958333333336 | 9.44 |
| 45004.96875 | 9.42 |
| 45004.979166666664 | 9.4 |
| 45004.989583333336 | 9.39 |
| 45005.0 | 9.36 |
| 45005.010416666664 | 9.42 |
| 45005.020833333336 | 9.41 |
| 45005.03125 | 9.37 |
| 45005.041666666664 | 9.36 |
| 45005.052083333336 | 9.28 |
| 45005.0625 | 9.28 |
| 45005.072916666664 | 9.25 |
| 45005.083333333336 | 9.2 |
| 45005.09375 | 9.11 |
| 45005.104166666664 | 9.01 |
| 45005.114583333336 | 9.06 |
| 45005.125 | 9.03 |
| 45005.135416666664 | 9.1 |
| 45005.145833333336 | 9.06 |
| 45005.15625 | 9.18 |
| 45005.166666666664 | 9.17 |
| 45005.177083333336 | 9.27 |
| 45005.1875 | 9.38 |
| 45005.197916666664 | 9.42 |
| 45005.208333333336 | 9.45 |
| 45005.21875 | 9.38 |
| 45005.229166666664 | 9.4 |
| 45005.239583333336 | 9.32 |
| 45005.25 | 9.24 |
| 45005.260416666664 | 9.33 |
| 45005.270833333336 | 9.32 |
| 45005.28125 | 9.35 |
| 45005.291666666664 | 9.36 |
| 45005.302083333336 | 9.34 |
| 45005.3125 | 9.29 |
| 45005.322916666664 | 9.21 |
| 45005.333333333336 | 9.13 |
| 45005.34375 | 8.98 |
| 45005.354166666664 | 8.85 |
| 45005.364583333336 | 8.78 |
| 45005.375 | 8.72 |
| 45005.385416666664 | 8.71 |
| 45005.395833333336 | 8.74 |
| 45005.40625 | 8.77 |
| 45005.416666666664 | 8.82 |
| 45005.427083333336 | 8.88 |
| 45005.4375 | 8.92 |
| 45005.447916666664 | 8.93 |
| 45005.458333333336 | 8.95 |
| 45005.46875 | 8.96 |
| 45005.479166666664 | 8.96 |
| 45005.489583333336 | 8.96 |
| 45005.5 | 8.96 |
| 45005.510416666664 | 8.96 |
| 45005.520833333336 | 8.95 |
| 45005.53125 | 8.9 |
| 45005.541666666664 | 8.95 |
| 45005.552083333336 | 9.02 |
| 45005.5625 | 9.05 |
| 45005.572916666664 | 9.05 |
| 45005.583333333336 | 9.09 |
| 45005.59375 | 9.09 |
| 45005.604166666664 | 9.15 |
| 45005.614583333336 | 9.2 |
| 45005.625 | 9.26 |
| 45005.635416666664 | 9.29 |
| 45005.645833333336 | 9.33 |
| 45005.65625 | 9.37 |
| 45005.666666666664 | 9.41 |
| 45005.677083333336 | 9.37 |
| 45005.6875 | 9.36 |
| 45005.697916666664 | 9.38 |
| 45005.708333333336 | 9.41 |
| 45005.71875 | 9.47 |
| 45005.729166666664 | 9.52 |
| 45005.739583333336 | 9.62 |
| 45005.75 | 9.68 |
| 45005.760416666664 | 9.72 |
| 45005.770833333336 | 9.77 |
| 45005.78125 | 9.77 |
| 45005.791666666664 | 9.76 |
| 45005.802083333336 | 9.82 |
| 45005.8125 | 9.77 |
| 45005.822916666664 | 9.71 |
| 45005.833333333336 | 9.73 |
| 45005.84375 | 9.72 |
| 45005.854166666664 | 9.73 |
| 45005.864583333336 | 9.73 |
| 45005.875 | 9.74 |
| 45005.885416666664 | 9.76 |
| 45005.895833333336 | 9.75 |
| 45005.90625 | 9.74 |
| 45005.916666666664 | 9.73 |
| 45005.927083333336 | 9.71 |
| 45005.9375 | 9.66 |
| 45005.947916666664 | 9.6 |
| 45005.958333333336 | 9.55 |
| 45005.96875 | 9.53 |
| 45005.979166666664 | 9.51 |
| 45005.989583333336 | 9.5 |
| 45006.0 | 9.47 |
| 45006.010416666664 | 9.45 |
| 45006.020833333336 | 9.44 |
| 45006.03125 | 9.41 |
| 45006.041666666664 | 9.4 |
| 45006.052083333336 | 9.43 |
| 45006.0625 | 9.38 |
| 45006.072916666664 | 9.36 |
| 45006.083333333336 | 9.35 |
| 45006.09375 | 9.27 |
| 45006.104166666664 | 9.18 |
| 45006.114583333336 | 9.11 |
| 45006.125 | 9.05 |
| 45006.135416666664 | 8.97 |
| 45006.145833333336 | 8.94 |
| 45006.15625 | 8.92 |
| 45006.166666666664 | 8.99 |
| 45006.177083333336 | 8.99 |
| 45006.1875 | 9.08 |
| 45006.197916666664 | 9.19 |
| 45006.208333333336 | 9.25 |
| 45006.21875 | 9.28 |
| 45006.229166666664 | 9.44 |
| 45006.239583333336 | 9.36 |
| 45006.25 | 9.32 |
| 45006.260416666664 | 9.52 |
| 45006.270833333336 | 9.37 |
| 45006.28125 | 9.41 |
| 45006.291666666664 | 9.24 |
| 45006.302083333336 | 9.3 |
| 45006.3125 | 9.31 |
| 45006.322916666664 | 9.31 |
| 45006.333333333336 | 9.36 |
| 45006.34375 | 9.38 |
| 45006.354166666664 | 9.37 |
| 45006.364583333336 | 9.28 |
| 45006.375 | 9.21 |
| 45006.385416666664 | 9.01 |
| 45006.395833333336 | 8.79 |
| 45006.40625 | 8.67 |
| 45006.416666666664 | 8.6 |
| 45006.427083333336 | 8.61 |
| 45006.4375 | 8.65 |
| 45006.447916666664 | 8.7 |
| 45006.458333333336 | 8.76 |
| 45006.46875 | 8.8 |
| 45006.479166666664 | 8.86 |
| 45006.489583333336 | 8.89 |
| 45006.5 | 8.91 |
| 45006.510416666664 | 8.94 |
| 45006.520833333336 | 8.94 |
| 45006.53125 | 8.94 |
| 45006.541666666664 | 8.95 |
| 45006.552083333336 | 8.97 |
| 45006.5625 | 9.01 |
| 45006.572916666664 | 8.9 |
| 45006.583333333336 | 9 |
| 45006.59375 | 9.05 |
| 45006.604166666664 | 9.05 |
| 45006.614583333336 | 9.04 |
| 45006.625 | 9.12 |
| 45006.635416666664 | 9.11 |
| 45006.645833333336 | 9.12 |
| 45006.65625 | 9.17 |
| 45006.666666666664 | 9.18 |
| 45006.677083333336 | 9.19 |
| 45006.6875 | 9.22 |
| 45006.697916666664 | 9.24 |
| 45006.708333333336 | 9.26 |
| 45006.71875 | 9.3 |
| 45006.729166666664 | 9.37 |
| 45006.739583333336 | 9.45 |
| 45006.75 | 9.54 |
| 45006.760416666664 | 9.65 |
| 45006.770833333336 | 9.76 |
| 45006.78125 | 9.84 |
| 45006.791666666664 | 9.89 |
| 45006.802083333336 | 9.92 |
| 45006.8125 | 9.92 |
| 45006.822916666664 | 10.02 |
| 45006.833333333336 | 9.97 |
| 45006.84375 | 9.89 |
| 45006.854166666664 | 9.82 |
| 45006.864583333336 | 9.8 |
| 45006.875 | 9.78 |
| 45006.885416666664 | 9.79 |
| 45006.895833333336 | 9.75 |
| 45006.90625 | 9.69 |
| 45006.916666666664 | 9.6 |
| 45006.927083333336 | 9.54 |
| 45006.9375 | 9.48 |
| 45006.947916666664 | 9.47 |
| 45006.958333333336 | 9.45 |
| 45006.96875 | 9.4 |
| 45006.979166666664 | 9.36 |
| 45006.989583333336 | 9.33 |
| 45007.0 | 9.36 |
| 45007.010416666664 | 9.33 |
| 45007.020833333336 | 9.31 |
| 45007.03125 | 9.28 |
| 45007.041666666664 | 9.25 |
| 45007.052083333336 | 9.22 |
| 45007.0625 | 9.2 |
| 45007.072916666664 | 9.18 |
| 45007.083333333336 | 9.19 |
| 45007.09375 | 9.2 |
| 45007.104166666664 | 9.16 |
| 45007.114583333336 | 9.11 |
| 45007.125 | 9.06 |
| 45007.135416666664 | 9.03 |
| 45007.145833333336 | 8.88 |
| 45007.15625 | 8.78 |
| 45007.166666666664 | 8.81 |
| 45007.177083333336 | 8.69 |
| 45007.1875 | 8.7 |
| 45007.197916666664 | 8.72 |
| 45007.208333333336 | 8.72 |
| 45007.21875 | 8.74 |
| 45007.229166666664 | 8.8 |
| 45007.239583333336 | 8.87 |
| 45007.25 | 8.89 |
| 45007.260416666664 | 8.91 |
| 45007.270833333336 | 8.95 |
| 45007.28125 | 8.97 |
| 45007.291666666664 | 8.99 |
| 45007.302083333336 | 9.01 |
| 45007.3125 | 8.93 |
| 45007.322916666664 | 8.82 |
| 45007.333333333336 | 8.86 |
| 45007.34375 | 8.84 |
| 45007.354166666664 | 8.82 |
| 45007.364583333336 | 8.88 |
| 45007.375 | 8.89 |
| 45007.385416666664 | 8.89 |
| 45007.395833333336 | 8.81 |
| 45007.40625 | 8.77 |
| 45007.416666666664 | 8.63 |
| 45007.427083333336 | 8.44 |
| 45007.4375 | 8.31 |
| 45007.447916666664 | 8.25 |
| 45007.458333333336 | 8.23 |
| 45007.46875 | 8.26 |
| 45007.479166666664 | 8.32 |
| 45007.489583333336 | 8.38 |
| 45007.5 | 8.45 |
| 45007.510416666664 | 8.52 |
| 45007.520833333336 | 8.61 |
| 45007.53125 | 8.67 |
| 45007.541666666664 | 8.69 |
| 45007.552083333336 | 8.7 |
| 45007.5625 | 8.69 |
| 45007.572916666664 | 8.68 |
| 45007.583333333336 | 8.69 |
| 45007.59375 | 8.73 |
| 45007.604166666664 | 8.6 |
| 45007.614583333336 | 8.7 |
| 45007.625 | 8.75 |
| 45007.635416666664 | 8.82 |
| 45007.645833333336 | 8.77 |
| 45007.65625 | 8.79 |
| 45007.666666666664 | 8.8 |
| 45007.677083333336 | 8.8 |
| 45007.6875 | 8.82 |
| 45007.697916666664 | 8.83 |
| 45007.708333333336 | 8.81 |
| 45007.71875 | 8.81 |
| 45007.729166666664 | 8.84 |
| 45007.739583333336 | 8.87 |
| 45007.75 | 8.94 |
| 45007.760416666664 | 9.04 |
| 45007.770833333336 | 9.16 |
| 45007.78125 | 9.25 |
| 45007.791666666664 | 9.38 |
| 45007.802083333336 | 9.55 |
| 45007.8125 | 9.69 |
| 45007.822916666664 | 9.79 |
| 45007.833333333336 | 9.84 |
| 45007.84375 | 9.87 |
| 45007.854166666664 | 9.72 |
| 45007.864583333336 | 9.9 |
| 45007.875 | 9.87 |
| 45007.885416666664 | 9.73 |
| 45007.895833333336 | 9.65 |
| 45007.90625 | 9.56 |
| 45007.916666666664 | 9.57 |
| 45007.927083333336 | 9.54 |
| 45007.9375 | 9.49 |
| 45007.947916666664 | 9.43 |
| 45007.958333333336 | 9.33 |
| 45007.96875 | 9.26 |
| 45007.979166666664 | 9.23 |
| 45007.989583333336 | 9.17 |
| 45008.0 | 9.08 |
| 45008.010416666664 | 9.08 |
| 45008.020833333336 | 9.07 |
| 45008.03125 | 9.07 |
| 45008.041666666664 | 9.06 |
| 45008.052083333336 | 9.01 |
| 45008.0625 | 8.98 |
| 45008.072916666664 | 8.94 |
| 45008.083333333336 | 8.92 |
| 45008.09375 | 8.9 |
| 45008.104166666664 | 8.9 |
| 45008.114583333336 | 8.89 |
| 45008.125 | 8.92 |
| 45008.135416666664 | 8.89 |
| 45008.145833333336 | 8.87 |
| 45008.15625 | 8.81 |
| 45008.166666666664 | 8.75 |
| 45008.177083333336 | 8.65 |
| 45008.1875 | 8.59 |
| 45008.197916666664 | 8.49 |
| 45008.208333333336 | 8.4 |
| 45008.21875 | 8.33 |
| 45008.229166666664 | 8.14 |
| 45008.239583333336 | 8.17 |
| 45008.25 | 8.2 |
| 45008.260416666664 | 8.21 |
| 45008.270833333336 | 8.31 |
| 45008.28125 | 8.4 |
| 45008.291666666664 | 8.48 |
| 45008.302083333336 | 8.45 |
| 45008.3125 | 8.55 |
| 45008.322916666664 | 8.64 |
| 45008.333333333336 | 8.55 |
| 45008.34375 | 8.63 |
| 45008.354166666664 | 8.61 |
| 45008.364583333336 | 8.59 |
| 45008.375 | 8.52 |
| 45008.385416666664 | 8.51 |
| 45008.395833333336 | 8.52 |
| 45008.40625 | 8.5 |
| 45008.416666666664 | 8.47 |
| 45008.427083333336 | 8.45 |
| 45008.4375 | 8.38 |
| 45008.447916666664 | 8.32 |
| 45008.458333333336 | 8.26 |
| 45008.46875 | 8.22 |
| 45008.479166666664 | 8.23 |
| 45008.489583333336 | 8.24 |
| 45008.5 | 8.27 |
| 45008.510416666664 | 8.3 |
| 45008.520833333336 | 8.34 |
| 45008.53125 | 8.4 |
| 45008.541666666664 | 8.46 |
| 45008.552083333336 | 8.5 |
| 45008.5625 | 8.5 |
| 45008.572916666664 | 8.47 |
| 45008.583333333336 | 8.46 |
| 45008.59375 | 8.45 |
| 45008.604166666664 | 8.46 |
| 45008.614583333336 | 8.47 |
| 45008.625 | 8.49 |
| 45008.635416666664 | 8.58 |
| 45008.645833333336 | 8.5 |
| 45008.65625 | 8.62 |
| 45008.666666666664 | 8.7 |
| 45008.677083333336 | 8.75 |
| 45008.6875 | 8.87 |
| 45008.697916666664 | 8.92 |
| 45008.708333333336 | 8.91 |
| 45008.71875 | 8.93 |
| 45008.729166666664 | 8.97 |
| 45008.739583333336 | 8.98 |
| 45008.75 | 8.92 |
| 45008.760416666664 | 8.92 |
| 45008.770833333336 | 8.95 |
| 45008.78125 | 9 |
| 45008.791666666664 | 9.03 |
| 45008.802083333336 | 9.03 |
| 45008.8125 | 9.09 |
| 45008.822916666664 | 9.13 |
| 45008.833333333336 | 9.19 |
| 45008.84375 | 9.26 |
| 45008.854166666664 | 9.34 |
| 45008.864583333336 | 9.41 |
| 45008.875 | 9.4 |
| 45008.885416666664 | 9.27 |
| 45008.895833333336 | 9.22 |
| 45008.90625 | 9.12 |
| 45008.916666666664 | 9.09 |
| 45008.927083333336 | 9.04 |
| 45008.9375 | 8.97 |
| 45008.947916666664 | 8.92 |
| 45008.958333333336 | 8.87 |
| 45008.96875 | 8.79 |
| 45008.979166666664 | 8.72 |
| 45008.989583333336 | 8.65 |
| 45009.0 | 8.55 |
| 45009.010416666664 | 8.54 |
| 45009.020833333336 | 8.55 |
| 45009.03125 | 8.57 |
| 45009.041666666664 | 8.63 |
| 45009.052083333336 | 8.66 |
| 45009.0625 | 8.68 |
| 45009.072916666664 | 8.69 |
| 45009.083333333336 | 8.67 |
| 45009.09375 | 8.65 |
| 45009.104166666664 | 8.62 |
| 45009.114583333336 | 8.61 |
| 45009.125 | 8.61 |
| 45009.135416666664 | 8.61 |
| 45009.145833333336 | 8.58 |
| 45009.15625 | 8.56 |
| 45009.166666666664 | 8.58 |
| 45009.177083333336 | 8.53 |
| 45009.1875 | 8.41 |
| 45009.197916666664 | 8.3 |
| 45009.208333333336 | 8.19 |
| 45009.21875 | 8.11 |
| 45009.229166666664 | 8.01 |
| 45009.239583333336 | 7.81 |
| 45009.25 | 7.59 |
| 45009.260416666664 | 7.56 |
| 45009.270833333336 | 7.42 |
| 45009.28125 | 7.47 |
| 45009.291666666664 | 7.45 |
| 45009.302083333336 | 7.6 |
| 45009.3125 | 7.68 |
| 45009.322916666664 | 7.72 |
| 45009.333333333336 | 7.72 |
| 45009.34375 | 7.75 |
| 45009.354166666664 | 7.74 |
| 45009.364583333336 | 7.68 |
| 45009.375 | 7.63 |
| 45009.385416666664 | 7.6 |
| 45009.395833333336 | 7.58 |
| 45009.40625 | 7.53 |
| 45009.416666666664 | 7.49 |
| 45009.427083333336 | 7.41 |
| 45009.4375 | 7.5 |
| 45009.447916666664 | 7.49 |
| 45009.458333333336 | 7.53 |
| 45009.46875 | 7.51 |
| 45009.479166666664 | 7.49 |
| 45009.489583333336 | 7.47 |
| 45009.5 | 7.42 |
| 45009.510416666664 | 7.41 |
| 45009.520833333336 | 7.4 |
| 45009.53125 | 7.43 |
| 45009.541666666664 | 7.47 |
| 45009.552083333336 | 7.53 |
| 45009.5625 | 7.66 |
| 45009.572916666664 | 7.79 |
| 45009.583333333336 | 7.92 |
| 45009.59375 | 8 |
| 45009.604166666664 | 8.04 |
| 45009.614583333336 | 8.07 |
| 45009.625 | 8.05 |
| 45009.635416666664 | 8.06 |
| 45009.645833333336 | 7.97 |
| 45009.65625 | 8.07 |
| 45009.666666666664 | 8.11 |
| 45009.677083333336 | 8.2 |
| 45009.6875 | 8.31 |
| 45009.697916666664 | 8.32 |
| 45009.708333333336 | 8.34 |
| 45009.71875 | 8.32 |
| 45009.729166666664 | 8.29 |
| 45009.739583333336 | 8.32 |
| 45009.75 | 8.33 |
| 45009.760416666664 | 8.35 |
| 45009.770833333336 | 8.34 |
| 45009.78125 | 8.37 |
| 45009.791666666664 | 8.33 |
| 45009.802083333336 | 8.29 |
| 45009.8125 | 8.29 |
| 45009.822916666664 | 8.33 |
| 45009.833333333336 | 8.39 |
| 45009.84375 | 8.45 |
| 45009.854166666664 | 8.52 |
| 45009.864583333336 | 8.62 |
| 45009.875 | 8.68 |
| 45009.885416666664 | 8.71 |
| 45009.895833333336 | 8.72 |
| 45009.90625 | 8.68 |
| 45009.916666666664 | 8.62 |
| 45009.927083333336 | 8.64 |
| 45009.9375 | 8.61 |
| 45009.947916666664 | 8.58 |
| 45009.958333333336 | 8.52 |
| 45009.96875 | 8.45 |
| 45009.979166666664 | 8.36 |
| 45009.989583333336 | 8.36 |
| 45010.0 | 8.32 |
| 45010.010416666664 | 8.22 |
| 45010.020833333336 | 8.15 |
| 45010.03125 | 8.13 |
| 45010.041666666664 | 8.18 |
| 45010.052083333336 | 8.18 |
| 45010.0625 | 8.24 |
| 45010.072916666664 | 8.25 |
| 45010.083333333336 | 8.26 |
| 45010.09375 | 8.28 |
| 45010.104166666664 | 8.3 |
| 45010.114583333336 | 8.32 |
| 45010.125 | 8.34 |
| 45010.135416666664 | 8.33 |
| 45010.145833333336 | 8.32 |
| 45010.15625 | 8.18 |
| 45010.166666666664 | 8.23 |
| 45010.177083333336 | 8.15 |
| 45010.1875 | 8.02 |
| 45010.197916666664 | 8 |
| 45010.208333333336 | 7.98 |
| 45010.21875 | 7.99 |
| 45010.229166666664 | 8 |
| 45010.239583333336 | 7.98 |
| 45010.25 | 7.9 |
| 45010.260416666664 | 7.85 |
| 45010.270833333336 | 7.79 |
| 45010.28125 | 7.76 |
| 45010.291666666664 | 7.79 |
| 45010.302083333336 | 7.71 |
| 45010.3125 | 7.66 |
| 45010.322916666664 | 7.61 |
| 45010.333333333336 | 7.5 |
| 45010.34375 | 7.58 |
| 45010.354166666664 | 7.58 |
| 45010.364583333336 | 7.59 |
| 45010.375 | 7.6 |
| 45010.385416666664 | 7.55 |
| 45010.395833333336 | 7.52 |
| 45010.40625 | 7.49 |
| 45010.416666666664 | 7.45 |
| 45010.427083333336 | 7.42 |
| 45010.4375 | 7.39 |
| 45010.447916666664 | 7.38 |
| 45010.458333333336 | 7.39 |
| 45010.46875 | 7.36 |
| 45010.479166666664 | 7.37 |
| 45010.489583333336 | 7.42 |
| 45010.5 | 7.44 |
| 45010.510416666664 | 7.47 |
| 45010.520833333336 | 7.5 |
| 45010.53125 | 7.55 |
| 45010.541666666664 | 7.59 |
| 45010.552083333336 | 7.62 |
| 45010.5625 | 7.65 |
| 45010.572916666664 | 7.7 |
| 45010.583333333336 | 7.77 |
| 45010.59375 | 7.82 |
| 45010.604166666664 | 7.86 |
| 45010.614583333336 | 7.9 |
| 45010.625 | 7.92 |
| 45010.635416666664 | 8.01 |
| 45010.645833333336 | 8.03 |
| 45010.65625 | 8.09 |
| 45010.666666666664 | 8.12 |
| 45010.677083333336 | 8.1 |
| 45010.6875 | 8.12 |
| 45010.697916666664 | 7.95 |
| 45010.708333333336 | 8.1 |
| 45010.71875 | 8.23 |
| 45010.729166666664 | 8.29 |
| 45010.739583333336 | 8.31 |
| 45010.75 | 8.36 |
| 45010.760416666664 | 8.31 |
| 45010.770833333336 | 8.31 |
| 45010.78125 | 8.29 |
| 45010.791666666664 | 8.29 |
| 45010.802083333336 | 8.33 |
| 45010.8125 | 8.27 |
| 45010.822916666664 | 8.28 |
| 45010.833333333336 | 8.28 |
| 45010.84375 | 8.31 |
| 45010.854166666664 | 8.37 |
| 45010.864583333336 | 8.39 |
| 45010.875 | 8.4 |
| 45010.885416666664 | 8.43 |
| 45010.895833333336 | 8.43 |
| 45010.90625 | 8.46 |
| 45010.916666666664 | 8.44 |
| 45010.927083333336 | 8.4 |
| 45010.9375 | 8.37 |
| 45010.947916666664 | 8.31 |
| 45010.958333333336 | 8.27 |
| 45010.96875 | 8.25 |
| 45010.979166666664 | 8.27 |
| 45010.989583333336 | 8.34 |
| 45011.0 | 8.39 |
| 45011.010416666664 | 8.42 |
| 45011.020833333336 | 8.39 |
| 45011.03125 | 8.36 |
| 45011.041666666664 | 8.33 |
| 45011.052083333336 | 8.32 |
| 45011.0625 | 8.3 |
| 45011.072916666664 | 8.28 |
| 45011.083333333336 | 8.26 |
| 45011.09375 | 8.25 |
| 45011.104166666664 | 8.24 |
| 45011.114583333336 | 8.24 |
| 45011.125 | 8.22 |
| 45011.135416666664 | 8.22 |
| 45011.145833333336 | 8.22 |
| 45011.15625 | 8.22 |
| 45011.166666666664 | 8.21 |
| 45011.177083333336 | 8.19 |
| 45011.1875 | 8.18 |
| 45011.197916666664 | 8.17 |
| 45011.208333333336 | 8.16 |
| 45011.21875 | 8.08 |
| 45011.229166666664 | 8.12 |
| 45011.239583333336 | 8.11 |
| 45011.25 | 8.08 |
| 45011.260416666664 | 8.01 |
| 45011.270833333336 | 7.97 |
| 45011.28125 | 7.88 |
| 45011.291666666664 | 7.8 |
| 45011.302083333336 | 7.78 |
| 45011.3125 | 7.61 |
| 45011.322916666664 | 7.45 |
| 45011.333333333336 | 7.34 |
| 45011.34375 | 7.28 |
| 45011.354166666664 | 7.25 |
| 45011.364583333336 | 7.17 |
| 45011.375 | 7.16 |
| 45011.385416666664 | 7.28 |
| 45011.395833333336 | 7.29 |
| 45011.40625 | 7.33 |
| 45011.416666666664 | 7.45 |
| 45011.427083333336 | 7.44 |
| 45011.4375 | 7.46 |
| 45011.447916666664 | 7.45 |
| 45011.458333333336 | 7.44 |
| 45011.46875 | 7.41 |
| 45011.479166666664 | 7.4 |
| 45011.489583333336 | 7.38 |
| 45011.5 | 7.35 |
| 45011.510416666664 | 7.33 |
| 45011.520833333336 | 7.33 |
| 45011.53125 | 7.39 |
| 45011.541666666664 | 7.41 |
| 45011.552083333336 | 7.44 |
| 45011.5625 | 7.53 |
| 45011.572916666664 | 7.6 |
| 45011.583333333336 | 7.66 |
| 45011.59375 | 7.69 |
| 45011.604166666664 | 7.73 |
| 45011.614583333336 | 7.79 |
| 45011.625 | 7.85 |
| 45011.635416666664 | 7.93 |
| 45011.645833333336 | 7.98 |
| 45011.65625 | 8.02 |
| 45011.666666666664 | 8.08 |
| 45011.677083333336 | 8.13 |
| 45011.6875 | 8.19 |
| 45011.697916666664 | 8.24 |
| 45011.708333333336 | 8.29 |
| 45011.71875 | 8.3 |
| 45011.729166666664 | 8.34 |
| 45011.739583333336 | 8.36 |
| 45011.75 | 8.44 |
| 45011.760416666664 | 8.52 |
| 45011.770833333336 | 8.55 |
| 45011.78125 | 8.55 |
| 45011.791666666664 | 8.57 |
| 45011.802083333336 | 8.6 |
| 45011.8125 | 8.5 |
| 45011.822916666664 | 8.54 |
| 45011.833333333336 | 8.64 |
| 45011.84375 | 8.62 |
| 45011.854166666664 | 8.6 |
| 45011.864583333336 | 8.61 |
| 45011.875 | 8.61 |
| 45011.885416666664 | 8.67 |
| 45011.895833333336 | 8.65 |
| 45011.90625 | 8.69 |
| 45011.916666666664 | 8.63 |
| 45011.927083333336 | 8.63 |
| 45011.9375 | 8.57 |
| 45011.947916666664 | 8.56 |
| 45011.958333333336 | 8.55 |
| 45011.96875 | 8.49 |
| 45011.979166666664 | 8.48 |
| 45011.989583333336 | 8.44 |
| 45012.0 | 8.39 |
| 45012.010416666664 | 8.33 |
| 45012.020833333336 | 8.35 |
| 45012.03125 | 8.49 |
| 45012.041666666664 | 8.52 |
| 45012.052083333336 | 8.55 |
| 45012.0625 | 8.46 |
| 45012.072916666664 | 8.41 |
| 45012.083333333336 | 8.36 |
| 45012.09375 | 8.33 |
| 45012.104166666664 | 8.3 |
| 45012.114583333336 | 8.29 |
| 45012.125 | 8.29 |
| 45012.135416666664 | 8.28 |
| 45012.145833333336 | 8.31 |
| 45012.15625 | 8.31 |
| 45012.166666666664 | 8.31 |
| 45012.177083333336 | 8.32 |
| 45012.1875 | 8.32 |
| 45012.197916666664 | 8.29 |
| 45012.208333333336 | 8.27 |
| 45012.21875 | 8.26 |
| 45012.229166666664 | 8.21 |
| 45012.239583333336 | 8.18 |
| 45012.25 | 8.16 |
| 45012.260416666664 | 8.14 |
| 45012.270833333336 | 8.07 |
| 45012.28125 | 8.01 |
| 45012.291666666664 | 7.84 |
| 45012.302083333336 | 7.73 |
| 45012.3125 | 7.61 |
| 45012.322916666664 | 7.52 |
| 45012.333333333336 | 7.4 |
| 45012.34375 | 7.37 |
| 45012.354166666664 | 7.19 |
| 45012.364583333336 | 7.37 |
| 45012.375 | 7.37 |
| 45012.385416666664 | 7.61 |
| 45012.395833333336 | 7.59 |
| 45012.40625 | 7.59 |
| 45012.416666666664 | 7.57 |
| 45012.427083333336 | 7.56 |
| 45012.4375 | 7.52 |
| 45012.447916666664 | 7.5 |
| 45012.458333333336 | 7.51 |
| 45012.46875 | 7.48 |
| 45012.479166666664 | 7.45 |
| 45012.489583333336 | 7.43 |
| 45012.5 | 7.41 |
| 45012.510416666664 | 7.4 |
| 45012.520833333336 | 7.4 |
| 45012.53125 | 7.38 |
| 45012.541666666664 | 7.35 |
| 45012.552083333336 | 7.36 |
| 45012.5625 | 7.39 |
| 45012.572916666664 | 7.37 |
| 45012.583333333336 | 7.39 |
| 45012.59375 | 7.45 |
| 45012.604166666664 | 7.49 |
| 45012.614583333336 | 7.52 |
| 45012.625 | 7.54 |
| 45012.635416666664 | 7.57 |
| 45012.645833333336 | 7.6 |
| 45012.65625 | 7.62 |
| 45012.666666666664 | 7.68 |
| 45012.677083333336 | 7.74 |
| 45012.6875 | 7.8 |
| 45012.697916666664 | 7.9 |
| 45012.708333333336 | 7.97 |
| 45012.71875 | 7.98 |
| 45012.729166666664 | 7.98 |
| 45012.739583333336 | 7.89 |
| 45012.75 | 8.01 |
| 45012.760416666664 | 8.06 |
| 45012.770833333336 | 8.08 |
| 45012.78125 | 8.18 |
| 45012.791666666664 | 8.24 |
| 45012.802083333336 | 8.31 |
| 45012.8125 | 8.38 |
| 45012.822916666664 | 8.33 |
| 45012.833333333336 | 8.37 |
| 45012.84375 | 8.35 |
| 45012.854166666664 | 8.32 |
| 45012.864583333336 | 8.22 |
| 45012.875 | 8.3 |
| 45012.885416666664 | 8.35 |
| 45012.895833333336 | 8.35 |
| 45012.90625 | 8.38 |
| 45012.916666666664 | 8.39 |
| 45012.927083333336 | 8.45 |
| 45012.9375 | 8.38 |
| 45012.947916666664 | 8.38 |
| 45012.958333333336 | 8.38 |
| 45012.96875 | 8.38 |
| 45012.979166666664 | 8.38 |
| 45012.989583333336 | 8.38 |
| 45013.0 | 8.37 |
| 45013.010416666664 | 8.29 |
| 45013.020833333336 | 8.23 |
| 45013.03125 | 8.18 |
| 45013.041666666664 | 8.11 |
| 45013.052083333336 | 8.1 |
| 45013.0625 | 8.14 |
| 45013.072916666664 | 8.13 |
| 45013.083333333336 | 8.11 |
| 45013.09375 | 8.08 |
| 45013.104166666664 | 8.02 |
| 45013.114583333336 | 8 |
| 45013.125 | 7.99 |
| 45013.135416666664 | 7.98 |
| 45013.145833333336 | 7.96 |
| 45013.15625 | 7.93 |
| 45013.166666666664 | 7.92 |
| 45013.177083333336 | 7.86 |
| 45013.1875 | 7.87 |
| 45013.197916666664 | 7.87 |
| 45013.208333333336 | 7.86 |
| 45013.21875 | 7.86 |
| 45013.229166666664 | 7.86 |
| 45013.239583333336 | 7.86 |
| 45013.25 | 7.85 |
| 45013.260416666664 | 7.84 |
| 45013.270833333336 | 7.77 |
| 45013.28125 | 7.75 |
| 45013.291666666664 | 7.75 |
| 45013.302083333336 | 7.71 |
| 45013.3125 | 7.64 |
| 45013.322916666664 | 7.54 |
| 45013.333333333336 | 7.45 |
| 45013.34375 | 7.38 |
| 45013.354166666664 | 7.37 |
| 45013.364583333336 | 7.25 |
| 45013.375 | 7.14 |
| 45013.385416666664 | 7.06 |
| 45013.395833333336 | 6.97 |
| 45013.40625 | 7.05 |
| 45013.416666666664 | 7.13 |
| 45013.427083333336 | 7.19 |
| 45013.4375 | 7.25 |
| 45013.447916666664 | 7.3 |
| 45013.458333333336 | 7.17 |
| 45013.46875 | 7.31 |
| 45013.479166666664 | 7.26 |
| 45013.489583333336 | 7.34 |
| 45013.5 | 7.31 |
| 45013.510416666664 | 7.34 |
| 45013.520833333336 | 7.34 |
| 45013.53125 | 7.34 |
| 45013.541666666664 | 7.35 |
| 45013.552083333336 | 7.36 |
| 45013.5625 | 7.34 |
| 45013.572916666664 | 7.34 |
| 45013.583333333336 | 7.33 |
| 45013.59375 | 7.35 |
| 45013.604166666664 | 7.37 |
| 45013.614583333336 | 7.41 |
| 45013.625 | 7.46 |
| 45013.635416666664 | 7.52 |
| 45013.645833333336 | 7.63 |
| 45013.65625 | 7.7 |
| 45013.666666666664 | 7.74 |
| 45013.677083333336 | 7.79 |
| 45013.6875 | 7.84 |
| 45013.697916666664 | 7.91 |
| 45013.708333333336 | 7.98 |
| 45013.71875 | 8.02 |
| 45013.729166666664 | 8.08 |
| 45013.739583333336 | 8.14 |
| 45013.75 | 8.18 |
| 45013.760416666664 | 8.21 |
| 45013.770833333336 | 8.25 |
| 45013.78125 | 8.27 |
| 45013.791666666664 | 8.31 |
| 45013.802083333336 | 8.36 |
| 45013.8125 | 8.38 |
| 45013.822916666664 | 8.45 |
| 45013.833333333336 | 8.47 |
| 45013.84375 | 8.51 |
| 45013.854166666664 | 8.53 |
| 45013.864583333336 | 8.53 |
| 45013.875 | 8.56 |
| 45013.885416666664 | 8.65 |
| 45013.895833333336 | 8.69 |
| 45013.90625 | 8.68 |
| 45013.916666666664 | 8.72 |
| 45013.927083333336 | 8.71 |
| 45013.9375 | 8.67 |
| 45013.947916666664 | 8.69 |
| 45013.958333333336 | 8.69 |
| 45013.96875 | 8.69 |
| 45013.979166666664 | 8.68 |
| 45013.989583333336 | 8.67 |
| 45014.0 | 8.66 |
| 45014.010416666664 | 8.67 |
| 45014.020833333336 | 8.66 |
| 45014.03125 | 8.66 |
| 45014.041666666664 | 8.65 |
| 45014.052083333336 | 8.63 |
| 45014.0625 | 8.63 |
| 45014.072916666664 | 8.54 |
| 45014.083333333336 | 8.5 |
| 45014.09375 | 8.46 |
| 45014.104166666664 | 8.44 |
| 45014.114583333336 | 8.41 |
| 45014.125 | 8.37 |
| 45014.135416666664 | 8.33 |
| 45014.145833333336 | 8.29 |
| 45014.15625 | 8.25 |
| 45014.166666666664 | 8.21 |
| 45014.177083333336 | 8.17 |
| 45014.1875 | 8.14 |
| 45014.197916666664 | 8.12 |
| 45014.208333333336 | 8.1 |
| 45014.21875 | 8.08 |
| 45014.229166666664 | 8.05 |
| 45014.239583333336 | 8.03 |
| 45014.25 | 8.02 |
| 45014.260416666664 | 8.02 |
| 45014.270833333336 | 8.03 |
| 45014.28125 | 8.03 |
| 45014.291666666664 | 8.02 |
| 45014.302083333336 | 7.97 |
| 45014.3125 | 7.96 |
| 45014.322916666664 | 7.95 |
| 45014.333333333336 | 7.94 |
| 45014.34375 | 7.89 |
| 45014.354166666664 | 7.88 |
| 45014.364583333336 | 7.86 |
| 45014.375 | 7.81 |
| 45014.385416666664 | 7.76 |
| 45014.395833333336 | 7.75 |
| 45014.40625 | 7.69 |
| 45014.416666666664 | 7.7 |
| 45014.427083333336 | 7.57 |
| 45014.4375 | 7.5 |
| 45014.447916666664 | 7.28 |
| 45014.458333333336 | 7.28 |
| 45014.46875 | 7.26 |
| 45014.479166666664 | 7.19 |
| 45014.489583333336 | 7.21 |
| 45014.5 | 7.51 |
| 45014.510416666664 | 7.49 |
| 45014.520833333336 | 7.57 |
| 45014.53125 | 7.59 |
| 45014.541666666664 | 7.63 |
| 45014.552083333336 | 7.65 |
| 45014.5625 | 7.67 |
| 45014.572916666664 | 7.68 |
| 45014.583333333336 | 7.73 |
| 45014.59375 | 7.72 |
| 45014.604166666664 | 7.7 |
| 45014.614583333336 | 7.71 |
| 45014.625 | 7.7 |
| 45014.635416666664 | 7.72 |
| 45014.645833333336 | 7.74 |
| 45014.65625 | 7.76 |
| 45014.666666666664 | 7.81 |
| 45014.677083333336 | 7.88 |
| 45014.6875 | 7.99 |
| 45014.697916666664 | 8.13 |
| 45014.708333333336 | 8.2 |
| 45014.71875 | 8.31 |
| 45014.729166666664 | 8.36 |
| 45014.739583333336 | 8.41 |
| 45014.75 | 8.49 |
| 45014.760416666664 | 8.54 |
| 45014.770833333336 | 8.61 |
| 45014.78125 | 8.66 |
| 45014.791666666664 | 8.7 |
| 45014.802083333336 | 8.71 |
| 45014.8125 | 8.71 |
| 45014.822916666664 | 8.73 |
| 45014.833333333336 | 8.74 |
| 45014.84375 | 8.98 |
| 45014.854166666664 | 9.15 |
| 45014.864583333336 | 9.15 |
| 45014.875 | 9.15 |
| 45014.885416666664 | 9.2 |
| 45014.895833333336 | 9.27 |
| 45014.90625 | 9.26 |
| 45014.916666666664 | 9.19 |
| 45014.927083333336 | 9.14 |
| 45014.9375 | 9.07 |
| 45014.947916666664 | 9.04 |
| 45014.958333333336 | 8.97 |
| 45014.96875 | 8.83 |
| 45014.979166666664 | 8.82 |
| 45014.989583333336 | 8.84 |
| 45015.0 | 8.83 |
| 45015.010416666664 | 8.83 |
| 45015.020833333336 | 8.84 |
| 45015.03125 | 8.83 |
| 45015.041666666664 | 8.82 |
| 45015.052083333336 | 8.81 |
| 45015.0625 | 8.79 |
| 45015.072916666664 | 8.75 |
| 45015.083333333336 | 8.69 |
| 45015.09375 | 8.63 |
| 45015.104166666664 | 8.61 |
| 45015.114583333336 | 8.53 |
| 45015.125 | 8.49 |
| 45015.135416666664 | 8.44 |
| 45015.145833333336 | 8.41 |
| 45015.15625 | 8.39 |
| 45015.166666666664 | 8.33 |
| 45015.177083333336 | 8.24 |
| 45015.1875 | 8.19 |
| 45015.197916666664 | 8.19 |
| 45015.208333333336 | 8.18 |
| 45015.21875 | 8.18 |
| 45015.229166666664 | 8.14 |
| 45015.239583333336 | 8.08 |
| 45015.25 | 8.02 |
| 45015.260416666664 | 7.98 |
| 45015.270833333336 | 7.95 |
| 45015.28125 | 7.93 |
| 45015.291666666664 | 7.92 |
| 45015.302083333336 | 7.9 |
| 45015.3125 | 7.89 |
| 45015.322916666664 | 7.88 |
| 45015.333333333336 | 7.82 |
| 45015.34375 | 7.83 |
| 45015.354166666664 | 7.85 |
| 45015.364583333336 | 7.82 |
| 45015.375 | 7.77 |
| 45015.385416666664 | 7.69 |
| 45015.395833333336 | 7.67 |
| 45015.40625 | 7.65 |
| 45015.416666666664 | 7.63 |
| 45015.427083333336 | 7.65 |
| 45015.4375 | 7.71 |
| 45015.447916666664 | 7.65 |
| 45015.458333333336 | 7.59 |
| 45015.46875 | 7.63 |
| 45015.479166666664 | 7.57 |
| 45015.489583333336 | 7.67 |
| 45015.5 | 7.76 |
| 45015.510416666664 | 7.81 |
| 45015.520833333336 | 7.86 |
| 45015.53125 | 7.89 |
| 45015.541666666664 | 7.93 |
| 45015.552083333336 | 7.94 |
| 45015.5625 | 7.96 |
| 45015.572916666664 | 7.96 |
| 45015.583333333336 | 7.97 |
| 45015.59375 | 8.05 |
| 45015.604166666664 | 8.16 |
| 45015.614583333336 | 8.12 |
| 45015.625 | 8.15 |
| 45015.635416666664 | 8.07 |
| 45015.645833333336 | 8.11 |
| 45015.65625 | 8.11 |
| 45015.666666666664 | 8.12 |
| 45015.677083333336 | 8.15 |
| 45015.6875 | 8.15 |
| 45015.697916666664 | 8.18 |
| 45015.708333333336 | 8.26 |
| 45015.71875 | 8.36 |
| 45015.729166666664 | 8.44 |
| 45015.739583333336 | 8.56 |
| 45015.75 | 8.73 |
| 45015.760416666664 | 8.8 |
| 45015.770833333336 | 8.85 |
| 45015.78125 | 8.89 |
| 45015.791666666664 | 8.92 |
| 45015.802083333336 | 8.94 |
| 45015.8125 | 8.96 |
| 45015.822916666664 | 8.98 |
| 45015.833333333336 | 9 |
| 45015.84375 | 9.02 |
| 45015.854166666664 | 9.01 |
| 45015.864583333336 | 9.07 |
| 45015.875 | 9.15 |
| 45015.885416666664 | 9.13 |
| 45015.895833333336 | 9.12 |
| 45015.90625 | 9.16 |
| 45015.916666666664 | 9.19 |
| 45015.927083333336 | 9.15 |
| 45015.9375 | 9.33 |
| 45015.947916666664 | 9.31 |
| 45015.958333333336 | 9.27 |
| 45015.96875 | 9.24 |
| 45015.979166666664 | 9.2 |
| 45015.989583333336 | 9.18 |
| 45016.0 | 9.07 |
| 45016.010416666664 | 9.02 |
| 45016.020833333336 | 8.98 |
| 45016.03125 | 8.96 |
| 45016.041666666664 | 8.95 |
| 45016.052083333336 | 8.97 |
| 45016.0625 | 9.02 |
| 45016.072916666664 | 9.04 |
| 45016.083333333336 | 9.06 |
| 45016.09375 | 9.06 |
| 45016.104166666664 | 9.04 |
| 45016.114583333336 | 9.03 |
| 45016.125 | 9.01 |
| 45016.135416666664 | 8.97 |
| 45016.145833333336 | 8.89 |
| 45016.15625 | 8.81 |
| 45016.166666666664 | 8.77 |
| 45016.177083333336 | 8.7 |
| 45016.1875 | 8.65 |
| 45016.197916666664 | 8.61 |
| 45016.208333333336 | 8.54 |
| 45016.21875 | 8.49 |
| 45016.229166666664 | 8.41 |
| 45016.239583333336 | 8.35 |
| 45016.25 | 8.32 |
| 45016.260416666664 | 8.31 |
| 45016.270833333336 | 8.29 |
| 45016.28125 | 8.26 |
| 45016.291666666664 | 8.23 |
| 45016.302083333336 | 8.21 |
| 45016.3125 | 8.18 |
| 45016.322916666664 | 8.17 |
| 45016.333333333336 | 8.15 |
| 45016.34375 | 8.13 |
| 45016.354166666664 | 8.13 |
| 45016.364583333336 | 8.12 |
| 45016.375 | 8.12 |
| 45016.385416666664 | 8.08 |
| 45016.395833333336 | 8.07 |
| 45016.40625 | 7.97 |
| 45016.416666666664 | 8.07 |
| 45016.427083333336 | 8.06 |
| 45016.4375 | 8.05 |
| 45016.447916666664 | 8.06 |
| 45016.458333333336 | 8 |
| 45016.46875 | 7.97 |
| 45016.479166666664 | 7.97 |
| 45016.489583333336 | 7.91 |
| 45016.5 | 7.89 |
| 45016.510416666664 | 7.95 |
| 45016.520833333336 | 8.02 |
| 45016.53125 | 8.09 |
| 45016.541666666664 | 8.11 |
| 45016.552083333336 | 8.15 |
| 45016.5625 | 8.19 |
| 45016.572916666664 | 8.21 |
| 45016.583333333336 | 8.25 |
| 45016.59375 | 8.27 |
| 45016.604166666664 | 8.29 |
| 45016.614583333336 | 8.32 |
| 45016.625 | 8.32 |
| 45016.635416666664 | 8.35 |
| 45016.645833333336 | 8.38 |
| 45016.65625 | 8.39 |
| 45016.666666666664 | 8.39 |
| 45016.677083333336 | 8.38 |
| 45016.6875 | 8.4 |
| 45016.697916666664 | 8.44 |
| 45016.708333333336 | 8.42 |
| 45016.71875 | 8.39 |
| 45016.729166666664 | 8.41 |
| 45016.739583333336 | 8.52 |
| 45016.75 | 8.52 |
| 45016.760416666664 | 8.67 |
| 45016.770833333336 | 8.73 |
| 45016.78125 | 8.76 |
| 45016.791666666664 | 8.74 |
| 45016.802083333336 | 8.72 |
| 45016.8125 | 8.68 |
| 45016.822916666664 | 8.67 |
| 45016.833333333336 | 8.66 |
| 45016.84375 | 8.66 |
| 45016.854166666664 | 8.66 |
| 45016.864583333336 | 8.68 |
| 45016.875 | 8.67 |
| 45016.885416666664 | 8.68 |
| 45016.895833333336 | 8.67 |
| 45016.90625 | 8.66 |
| 45016.916666666664 | 8.62 |
| 45016.927083333336 | 8.64 |
| 45016.9375 | 8.63 |
| 45016.947916666664 | 8.7 |
| 45016.958333333336 | 8.68 |
| 45016.96875 | 8.61 |
| 45016.979166666664 | 8.55 |
| 45016.989583333336 | 8.49 |
| 45017.0 | 8.46 |
| 45017.010416666664 | 8.47 |
| 45017.020833333336 | 8.45 |
| 45017.03125 | 8.4 |
| 45017.041666666664 | 8.5 |
| 45017.052083333336 | 8.55 |
| 45017.0625 | 8.53 |
| 45017.072916666664 | 8.51 |
| 45017.083333333336 | 8.5 |
| 45017.09375 | 8.48 |
| 45017.104166666664 | 8.49 |
| 45017.114583333336 | 8.5 |
| 45017.125 | 8.47 |
| 45017.135416666664 | 8.45 |
| 45017.145833333336 | 8.39 |